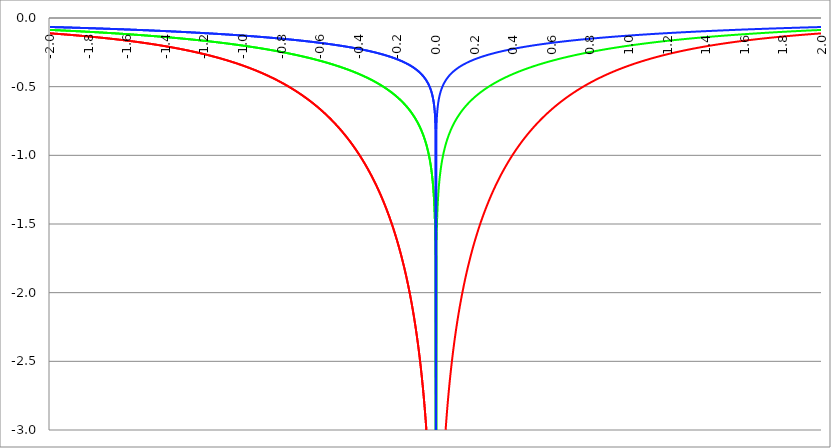
| Category | Series 1 | Series 0 | Series 2 |
|---|---|---|---|
| -2.0 | -0.112 | -0.087 | -0.065 |
| -1.998 | -0.112 | -0.087 | -0.066 |
| -1.996 | -0.112 | -0.087 | -0.066 |
| -1.994 | -0.112 | -0.087 | -0.066 |
| -1.992 | -0.112 | -0.087 | -0.066 |
| -1.99 | -0.113 | -0.087 | -0.066 |
| -1.988 | -0.113 | -0.087 | -0.066 |
| -1.986 | -0.113 | -0.088 | -0.066 |
| -1.984 | -0.113 | -0.088 | -0.066 |
| -1.982 | -0.113 | -0.088 | -0.066 |
| -1.98 | -0.114 | -0.088 | -0.066 |
| -1.978 | -0.114 | -0.088 | -0.066 |
| -1.976 | -0.114 | -0.088 | -0.066 |
| -1.974 | -0.114 | -0.088 | -0.066 |
| -1.972 | -0.114 | -0.088 | -0.067 |
| -1.97 | -0.115 | -0.089 | -0.067 |
| -1.968 | -0.115 | -0.089 | -0.067 |
| -1.966 | -0.115 | -0.089 | -0.067 |
| -1.964 | -0.115 | -0.089 | -0.067 |
| -1.962 | -0.115 | -0.089 | -0.067 |
| -1.96 | -0.116 | -0.089 | -0.067 |
| -1.958 | -0.116 | -0.089 | -0.067 |
| -1.956 | -0.116 | -0.089 | -0.067 |
| -1.954 | -0.116 | -0.09 | -0.067 |
| -1.952 | -0.117 | -0.09 | -0.067 |
| -1.95 | -0.117 | -0.09 | -0.067 |
| -1.948 | -0.117 | -0.09 | -0.068 |
| -1.946 | -0.117 | -0.09 | -0.068 |
| -1.944 | -0.117 | -0.09 | -0.068 |
| -1.942 | -0.118 | -0.09 | -0.068 |
| -1.94 | -0.118 | -0.091 | -0.068 |
| -1.938 | -0.118 | -0.091 | -0.068 |
| -1.936 | -0.118 | -0.091 | -0.068 |
| -1.934 | -0.118 | -0.091 | -0.068 |
| -1.932 | -0.119 | -0.091 | -0.068 |
| -1.93 | -0.119 | -0.091 | -0.068 |
| -1.928 | -0.119 | -0.091 | -0.068 |
| -1.926 | -0.119 | -0.091 | -0.068 |
| -1.924 | -0.12 | -0.092 | -0.068 |
| -1.922 | -0.12 | -0.092 | -0.069 |
| -1.92 | -0.12 | -0.092 | -0.069 |
| -1.918 | -0.12 | -0.092 | -0.069 |
| -1.916 | -0.12 | -0.092 | -0.069 |
| -1.914 | -0.121 | -0.092 | -0.069 |
| -1.912 | -0.121 | -0.092 | -0.069 |
| -1.91 | -0.121 | -0.093 | -0.069 |
| -1.908 | -0.121 | -0.093 | -0.069 |
| -1.906 | -0.122 | -0.093 | -0.069 |
| -1.904 | -0.122 | -0.093 | -0.069 |
| -1.902 | -0.122 | -0.093 | -0.069 |
| -1.9 | -0.122 | -0.093 | -0.069 |
| -1.898 | -0.122 | -0.093 | -0.07 |
| -1.896 | -0.123 | -0.093 | -0.07 |
| -1.894 | -0.123 | -0.094 | -0.07 |
| -1.892 | -0.123 | -0.094 | -0.07 |
| -1.89 | -0.123 | -0.094 | -0.07 |
| -1.888 | -0.124 | -0.094 | -0.07 |
| -1.886 | -0.124 | -0.094 | -0.07 |
| -1.884 | -0.124 | -0.094 | -0.07 |
| -1.882 | -0.124 | -0.094 | -0.07 |
| -1.88 | -0.125 | -0.095 | -0.07 |
| -1.878 | -0.125 | -0.095 | -0.07 |
| -1.876 | -0.125 | -0.095 | -0.07 |
| -1.874 | -0.125 | -0.095 | -0.071 |
| -1.872 | -0.126 | -0.095 | -0.071 |
| -1.87 | -0.126 | -0.095 | -0.071 |
| -1.868 | -0.126 | -0.095 | -0.071 |
| -1.866 | -0.126 | -0.096 | -0.071 |
| -1.864 | -0.126 | -0.096 | -0.071 |
| -1.862 | -0.127 | -0.096 | -0.071 |
| -1.86 | -0.127 | -0.096 | -0.071 |
| -1.858 | -0.127 | -0.096 | -0.071 |
| -1.856 | -0.127 | -0.096 | -0.071 |
| -1.854 | -0.128 | -0.096 | -0.071 |
| -1.852 | -0.128 | -0.097 | -0.072 |
| -1.85 | -0.128 | -0.097 | -0.072 |
| -1.848 | -0.128 | -0.097 | -0.072 |
| -1.846 | -0.129 | -0.097 | -0.072 |
| -1.844 | -0.129 | -0.097 | -0.072 |
| -1.842 | -0.129 | -0.097 | -0.072 |
| -1.84 | -0.129 | -0.098 | -0.072 |
| -1.838 | -0.13 | -0.098 | -0.072 |
| -1.836 | -0.13 | -0.098 | -0.072 |
| -1.834 | -0.13 | -0.098 | -0.072 |
| -1.832 | -0.13 | -0.098 | -0.072 |
| -1.83 | -0.131 | -0.098 | -0.072 |
| -1.828 | -0.131 | -0.098 | -0.073 |
| -1.826 | -0.131 | -0.099 | -0.073 |
| -1.824 | -0.131 | -0.099 | -0.073 |
| -1.822 | -0.132 | -0.099 | -0.073 |
| -1.82 | -0.132 | -0.099 | -0.073 |
| -1.818 | -0.132 | -0.099 | -0.073 |
| -1.816 | -0.132 | -0.099 | -0.073 |
| -1.814 | -0.133 | -0.099 | -0.073 |
| -1.812 | -0.133 | -0.1 | -0.073 |
| -1.81 | -0.133 | -0.1 | -0.073 |
| -1.808 | -0.133 | -0.1 | -0.073 |
| -1.806 | -0.134 | -0.1 | -0.074 |
| -1.804 | -0.134 | -0.1 | -0.074 |
| -1.802 | -0.134 | -0.1 | -0.074 |
| -1.8 | -0.134 | -0.101 | -0.074 |
| -1.798 | -0.135 | -0.101 | -0.074 |
| -1.796 | -0.135 | -0.101 | -0.074 |
| -1.794 | -0.135 | -0.101 | -0.074 |
| -1.792 | -0.136 | -0.101 | -0.074 |
| -1.79 | -0.136 | -0.101 | -0.074 |
| -1.788 | -0.136 | -0.101 | -0.074 |
| -1.786 | -0.136 | -0.102 | -0.074 |
| -1.784 | -0.137 | -0.102 | -0.075 |
| -1.782 | -0.137 | -0.102 | -0.075 |
| -1.78 | -0.137 | -0.102 | -0.075 |
| -1.778 | -0.137 | -0.102 | -0.075 |
| -1.776 | -0.138 | -0.102 | -0.075 |
| -1.774 | -0.138 | -0.103 | -0.075 |
| -1.772 | -0.138 | -0.103 | -0.075 |
| -1.77 | -0.139 | -0.103 | -0.075 |
| -1.768 | -0.139 | -0.103 | -0.075 |
| -1.766 | -0.139 | -0.103 | -0.075 |
| -1.764 | -0.139 | -0.103 | -0.076 |
| -1.762 | -0.14 | -0.103 | -0.076 |
| -1.76 | -0.14 | -0.104 | -0.076 |
| -1.758 | -0.14 | -0.104 | -0.076 |
| -1.756 | -0.14 | -0.104 | -0.076 |
| -1.754 | -0.141 | -0.104 | -0.076 |
| -1.752 | -0.141 | -0.104 | -0.076 |
| -1.75 | -0.141 | -0.104 | -0.076 |
| -1.748 | -0.142 | -0.105 | -0.076 |
| -1.746 | -0.142 | -0.105 | -0.076 |
| -1.744 | -0.142 | -0.105 | -0.076 |
| -1.742 | -0.142 | -0.105 | -0.077 |
| -1.74 | -0.143 | -0.105 | -0.077 |
| -1.738 | -0.143 | -0.105 | -0.077 |
| -1.736 | -0.143 | -0.106 | -0.077 |
| -1.734 | -0.144 | -0.106 | -0.077 |
| -1.732 | -0.144 | -0.106 | -0.077 |
| -1.73 | -0.144 | -0.106 | -0.077 |
| -1.728 | -0.144 | -0.106 | -0.077 |
| -1.726 | -0.145 | -0.106 | -0.077 |
| -1.724 | -0.145 | -0.107 | -0.077 |
| -1.722 | -0.145 | -0.107 | -0.078 |
| -1.72 | -0.146 | -0.107 | -0.078 |
| -1.718 | -0.146 | -0.107 | -0.078 |
| -1.716 | -0.146 | -0.107 | -0.078 |
| -1.714 | -0.146 | -0.107 | -0.078 |
| -1.712 | -0.147 | -0.108 | -0.078 |
| -1.71 | -0.147 | -0.108 | -0.078 |
| -1.708 | -0.147 | -0.108 | -0.078 |
| -1.706 | -0.148 | -0.108 | -0.078 |
| -1.704 | -0.148 | -0.108 | -0.078 |
| -1.702 | -0.148 | -0.108 | -0.078 |
| -1.7 | -0.149 | -0.109 | -0.079 |
| -1.698 | -0.149 | -0.109 | -0.079 |
| -1.696 | -0.149 | -0.109 | -0.079 |
| -1.694 | -0.149 | -0.109 | -0.079 |
| -1.692 | -0.15 | -0.109 | -0.079 |
| -1.69 | -0.15 | -0.109 | -0.079 |
| -1.688 | -0.15 | -0.11 | -0.079 |
| -1.686 | -0.151 | -0.11 | -0.079 |
| -1.684 | -0.151 | -0.11 | -0.079 |
| -1.682 | -0.151 | -0.11 | -0.079 |
| -1.68 | -0.152 | -0.11 | -0.08 |
| -1.678 | -0.152 | -0.111 | -0.08 |
| -1.676 | -0.152 | -0.111 | -0.08 |
| -1.674 | -0.153 | -0.111 | -0.08 |
| -1.672 | -0.153 | -0.111 | -0.08 |
| -1.67 | -0.153 | -0.111 | -0.08 |
| -1.668 | -0.154 | -0.111 | -0.08 |
| -1.666 | -0.154 | -0.112 | -0.08 |
| -1.664 | -0.154 | -0.112 | -0.08 |
| -1.662 | -0.154 | -0.112 | -0.08 |
| -1.66 | -0.155 | -0.112 | -0.081 |
| -1.658 | -0.155 | -0.112 | -0.081 |
| -1.656 | -0.155 | -0.112 | -0.081 |
| -1.654 | -0.156 | -0.113 | -0.081 |
| -1.652 | -0.156 | -0.113 | -0.081 |
| -1.65 | -0.156 | -0.113 | -0.081 |
| -1.648 | -0.157 | -0.113 | -0.081 |
| -1.646 | -0.157 | -0.113 | -0.081 |
| -1.644 | -0.157 | -0.114 | -0.081 |
| -1.642 | -0.158 | -0.114 | -0.082 |
| -1.64 | -0.158 | -0.114 | -0.082 |
| -1.638 | -0.158 | -0.114 | -0.082 |
| -1.636 | -0.159 | -0.114 | -0.082 |
| -1.634 | -0.159 | -0.114 | -0.082 |
| -1.632 | -0.159 | -0.115 | -0.082 |
| -1.63 | -0.16 | -0.115 | -0.082 |
| -1.628 | -0.16 | -0.115 | -0.082 |
| -1.626 | -0.16 | -0.115 | -0.082 |
| -1.624 | -0.161 | -0.115 | -0.082 |
| -1.622 | -0.161 | -0.116 | -0.083 |
| -1.62 | -0.161 | -0.116 | -0.083 |
| -1.618 | -0.162 | -0.116 | -0.083 |
| -1.616 | -0.162 | -0.116 | -0.083 |
| -1.614 | -0.162 | -0.116 | -0.083 |
| -1.612 | -0.163 | -0.116 | -0.083 |
| -1.61 | -0.163 | -0.117 | -0.083 |
| -1.608 | -0.163 | -0.117 | -0.083 |
| -1.606 | -0.164 | -0.117 | -0.083 |
| -1.604 | -0.164 | -0.117 | -0.084 |
| -1.602 | -0.165 | -0.117 | -0.084 |
| -1.6 | -0.165 | -0.118 | -0.084 |
| -1.598 | -0.165 | -0.118 | -0.084 |
| -1.596 | -0.166 | -0.118 | -0.084 |
| -1.594 | -0.166 | -0.118 | -0.084 |
| -1.592 | -0.166 | -0.118 | -0.084 |
| -1.59 | -0.167 | -0.119 | -0.084 |
| -1.588 | -0.167 | -0.119 | -0.084 |
| -1.586 | -0.167 | -0.119 | -0.085 |
| -1.584 | -0.168 | -0.119 | -0.085 |
| -1.582 | -0.168 | -0.119 | -0.085 |
| -1.58 | -0.168 | -0.12 | -0.085 |
| -1.578 | -0.169 | -0.12 | -0.085 |
| -1.576 | -0.169 | -0.12 | -0.085 |
| -1.574 | -0.17 | -0.12 | -0.085 |
| -1.572 | -0.17 | -0.12 | -0.085 |
| -1.57 | -0.17 | -0.121 | -0.085 |
| -1.568 | -0.171 | -0.121 | -0.086 |
| -1.566 | -0.171 | -0.121 | -0.086 |
| -1.564 | -0.171 | -0.121 | -0.086 |
| -1.562 | -0.172 | -0.121 | -0.086 |
| -1.56 | -0.172 | -0.122 | -0.086 |
| -1.558 | -0.172 | -0.122 | -0.086 |
| -1.556 | -0.173 | -0.122 | -0.086 |
| -1.554 | -0.173 | -0.122 | -0.086 |
| -1.552 | -0.174 | -0.122 | -0.086 |
| -1.55 | -0.174 | -0.123 | -0.087 |
| -1.548 | -0.174 | -0.123 | -0.087 |
| -1.546 | -0.175 | -0.123 | -0.087 |
| -1.544 | -0.175 | -0.123 | -0.087 |
| -1.542 | -0.176 | -0.123 | -0.087 |
| -1.54 | -0.176 | -0.124 | -0.087 |
| -1.538 | -0.176 | -0.124 | -0.087 |
| -1.536 | -0.177 | -0.124 | -0.087 |
| -1.534 | -0.177 | -0.124 | -0.087 |
| -1.532 | -0.177 | -0.124 | -0.088 |
| -1.53 | -0.178 | -0.125 | -0.088 |
| -1.528 | -0.178 | -0.125 | -0.088 |
| -1.526 | -0.179 | -0.125 | -0.088 |
| -1.524 | -0.179 | -0.125 | -0.088 |
| -1.522 | -0.179 | -0.125 | -0.088 |
| -1.52 | -0.18 | -0.126 | -0.088 |
| -1.518 | -0.18 | -0.126 | -0.088 |
| -1.516 | -0.181 | -0.126 | -0.088 |
| -1.514 | -0.181 | -0.126 | -0.089 |
| -1.512 | -0.181 | -0.126 | -0.089 |
| -1.51 | -0.182 | -0.127 | -0.089 |
| -1.508 | -0.182 | -0.127 | -0.089 |
| -1.506 | -0.183 | -0.127 | -0.089 |
| -1.504 | -0.183 | -0.127 | -0.089 |
| -1.502 | -0.183 | -0.127 | -0.089 |
| -1.5 | -0.184 | -0.128 | -0.089 |
| -1.498 | -0.184 | -0.128 | -0.09 |
| -1.496 | -0.185 | -0.128 | -0.09 |
| -1.494 | -0.185 | -0.128 | -0.09 |
| -1.492 | -0.186 | -0.129 | -0.09 |
| -1.49 | -0.186 | -0.129 | -0.09 |
| -1.488 | -0.186 | -0.129 | -0.09 |
| -1.486 | -0.187 | -0.129 | -0.09 |
| -1.484 | -0.187 | -0.129 | -0.09 |
| -1.482 | -0.188 | -0.13 | -0.09 |
| -1.48 | -0.188 | -0.13 | -0.091 |
| -1.478 | -0.188 | -0.13 | -0.091 |
| -1.476 | -0.189 | -0.13 | -0.091 |
| -1.474 | -0.189 | -0.131 | -0.091 |
| -1.472 | -0.19 | -0.131 | -0.091 |
| -1.469999999999999 | -0.19 | -0.131 | -0.091 |
| -1.467999999999999 | -0.191 | -0.131 | -0.091 |
| -1.465999999999999 | -0.191 | -0.131 | -0.091 |
| -1.463999999999999 | -0.191 | -0.132 | -0.092 |
| -1.461999999999999 | -0.192 | -0.132 | -0.092 |
| -1.459999999999999 | -0.192 | -0.132 | -0.092 |
| -1.457999999999999 | -0.193 | -0.132 | -0.092 |
| -1.455999999999999 | -0.193 | -0.133 | -0.092 |
| -1.453999999999999 | -0.194 | -0.133 | -0.092 |
| -1.451999999999999 | -0.194 | -0.133 | -0.092 |
| -1.449999999999999 | -0.195 | -0.133 | -0.092 |
| -1.447999999999999 | -0.195 | -0.133 | -0.093 |
| -1.445999999999999 | -0.195 | -0.134 | -0.093 |
| -1.443999999999999 | -0.196 | -0.134 | -0.093 |
| -1.441999999999999 | -0.196 | -0.134 | -0.093 |
| -1.439999999999999 | -0.197 | -0.134 | -0.093 |
| -1.437999999999999 | -0.197 | -0.135 | -0.093 |
| -1.435999999999999 | -0.198 | -0.135 | -0.093 |
| -1.433999999999999 | -0.198 | -0.135 | -0.093 |
| -1.431999999999999 | -0.199 | -0.135 | -0.094 |
| -1.429999999999999 | -0.199 | -0.135 | -0.094 |
| -1.427999999999999 | -0.2 | -0.136 | -0.094 |
| -1.425999999999999 | -0.2 | -0.136 | -0.094 |
| -1.423999999999999 | -0.2 | -0.136 | -0.094 |
| -1.421999999999999 | -0.201 | -0.136 | -0.094 |
| -1.419999999999999 | -0.201 | -0.137 | -0.094 |
| -1.417999999999999 | -0.202 | -0.137 | -0.094 |
| -1.415999999999999 | -0.202 | -0.137 | -0.095 |
| -1.413999999999999 | -0.203 | -0.137 | -0.095 |
| -1.411999999999999 | -0.203 | -0.138 | -0.095 |
| -1.409999999999999 | -0.204 | -0.138 | -0.095 |
| -1.407999999999999 | -0.204 | -0.138 | -0.095 |
| -1.405999999999999 | -0.205 | -0.138 | -0.095 |
| -1.403999999999999 | -0.205 | -0.139 | -0.095 |
| -1.401999999999999 | -0.206 | -0.139 | -0.095 |
| -1.399999999999999 | -0.206 | -0.139 | -0.096 |
| -1.397999999999999 | -0.207 | -0.139 | -0.096 |
| -1.395999999999999 | -0.207 | -0.139 | -0.096 |
| -1.393999999999999 | -0.208 | -0.14 | -0.096 |
| -1.391999999999999 | -0.208 | -0.14 | -0.096 |
| -1.389999999999999 | -0.209 | -0.14 | -0.096 |
| -1.387999999999999 | -0.209 | -0.14 | -0.096 |
| -1.385999999999999 | -0.21 | -0.141 | -0.097 |
| -1.383999999999999 | -0.21 | -0.141 | -0.097 |
| -1.381999999999999 | -0.211 | -0.141 | -0.097 |
| -1.379999999999999 | -0.211 | -0.141 | -0.097 |
| -1.377999999999999 | -0.212 | -0.142 | -0.097 |
| -1.375999999999999 | -0.212 | -0.142 | -0.097 |
| -1.373999999999999 | -0.213 | -0.142 | -0.097 |
| -1.371999999999999 | -0.213 | -0.142 | -0.097 |
| -1.369999999999999 | -0.214 | -0.143 | -0.098 |
| -1.367999999999999 | -0.214 | -0.143 | -0.098 |
| -1.365999999999999 | -0.215 | -0.143 | -0.098 |
| -1.363999999999999 | -0.215 | -0.143 | -0.098 |
| -1.361999999999999 | -0.216 | -0.144 | -0.098 |
| -1.359999999999999 | -0.216 | -0.144 | -0.098 |
| -1.357999999999999 | -0.217 | -0.144 | -0.098 |
| -1.355999999999999 | -0.217 | -0.144 | -0.099 |
| -1.353999999999999 | -0.218 | -0.145 | -0.099 |
| -1.351999999999999 | -0.218 | -0.145 | -0.099 |
| -1.349999999999999 | -0.219 | -0.145 | -0.099 |
| -1.347999999999999 | -0.219 | -0.145 | -0.099 |
| -1.345999999999999 | -0.22 | -0.146 | -0.099 |
| -1.343999999999999 | -0.22 | -0.146 | -0.099 |
| -1.341999999999999 | -0.221 | -0.146 | -0.1 |
| -1.339999999999999 | -0.221 | -0.146 | -0.1 |
| -1.337999999999999 | -0.222 | -0.147 | -0.1 |
| -1.335999999999999 | -0.222 | -0.147 | -0.1 |
| -1.333999999999999 | -0.223 | -0.147 | -0.1 |
| -1.331999999999999 | -0.224 | -0.148 | -0.1 |
| -1.329999999999999 | -0.224 | -0.148 | -0.1 |
| -1.327999999999999 | -0.225 | -0.148 | -0.1 |
| -1.325999999999999 | -0.225 | -0.148 | -0.101 |
| -1.323999999999999 | -0.226 | -0.149 | -0.101 |
| -1.321999999999999 | -0.226 | -0.149 | -0.101 |
| -1.319999999999999 | -0.227 | -0.149 | -0.101 |
| -1.317999999999999 | -0.227 | -0.149 | -0.101 |
| -1.315999999999999 | -0.228 | -0.15 | -0.101 |
| -1.313999999999999 | -0.228 | -0.15 | -0.101 |
| -1.311999999999999 | -0.229 | -0.15 | -0.102 |
| -1.309999999999999 | -0.23 | -0.15 | -0.102 |
| -1.307999999999999 | -0.23 | -0.151 | -0.102 |
| -1.305999999999999 | -0.231 | -0.151 | -0.102 |
| -1.303999999999999 | -0.231 | -0.151 | -0.102 |
| -1.301999999999999 | -0.232 | -0.151 | -0.102 |
| -1.299999999999999 | -0.232 | -0.152 | -0.102 |
| -1.297999999999999 | -0.233 | -0.152 | -0.103 |
| -1.295999999999999 | -0.234 | -0.152 | -0.103 |
| -1.293999999999999 | -0.234 | -0.153 | -0.103 |
| -1.291999999999999 | -0.235 | -0.153 | -0.103 |
| -1.289999999999999 | -0.235 | -0.153 | -0.103 |
| -1.287999999999999 | -0.236 | -0.153 | -0.103 |
| -1.285999999999999 | -0.236 | -0.154 | -0.103 |
| -1.283999999999999 | -0.237 | -0.154 | -0.104 |
| -1.281999999999999 | -0.238 | -0.154 | -0.104 |
| -1.279999999999999 | -0.238 | -0.154 | -0.104 |
| -1.277999999999999 | -0.239 | -0.155 | -0.104 |
| -1.275999999999999 | -0.239 | -0.155 | -0.104 |
| -1.273999999999999 | -0.24 | -0.155 | -0.104 |
| -1.271999999999999 | -0.241 | -0.156 | -0.105 |
| -1.269999999999999 | -0.241 | -0.156 | -0.105 |
| -1.267999999999999 | -0.242 | -0.156 | -0.105 |
| -1.265999999999999 | -0.242 | -0.156 | -0.105 |
| -1.263999999999999 | -0.243 | -0.157 | -0.105 |
| -1.261999999999999 | -0.244 | -0.157 | -0.105 |
| -1.259999999999999 | -0.244 | -0.157 | -0.105 |
| -1.257999999999999 | -0.245 | -0.158 | -0.106 |
| -1.255999999999999 | -0.245 | -0.158 | -0.106 |
| -1.253999999999999 | -0.246 | -0.158 | -0.106 |
| -1.251999999999999 | -0.247 | -0.158 | -0.106 |
| -1.249999999999999 | -0.247 | -0.159 | -0.106 |
| -1.247999999999999 | -0.248 | -0.159 | -0.106 |
| -1.245999999999999 | -0.249 | -0.159 | -0.106 |
| -1.243999999999999 | -0.249 | -0.16 | -0.107 |
| -1.241999999999999 | -0.25 | -0.16 | -0.107 |
| -1.239999999999999 | -0.25 | -0.16 | -0.107 |
| -1.237999999999999 | -0.251 | -0.16 | -0.107 |
| -1.235999999999999 | -0.252 | -0.161 | -0.107 |
| -1.233999999999999 | -0.252 | -0.161 | -0.107 |
| -1.231999999999999 | -0.253 | -0.161 | -0.108 |
| -1.229999999999999 | -0.254 | -0.162 | -0.108 |
| -1.227999999999999 | -0.254 | -0.162 | -0.108 |
| -1.225999999999999 | -0.255 | -0.162 | -0.108 |
| -1.223999999999999 | -0.256 | -0.163 | -0.108 |
| -1.221999999999999 | -0.256 | -0.163 | -0.108 |
| -1.219999999999999 | -0.257 | -0.163 | -0.108 |
| -1.217999999999999 | -0.258 | -0.163 | -0.109 |
| -1.215999999999999 | -0.258 | -0.164 | -0.109 |
| -1.213999999999999 | -0.259 | -0.164 | -0.109 |
| -1.211999999999999 | -0.26 | -0.164 | -0.109 |
| -1.209999999999999 | -0.26 | -0.165 | -0.109 |
| -1.207999999999999 | -0.261 | -0.165 | -0.109 |
| -1.205999999999999 | -0.262 | -0.165 | -0.11 |
| -1.203999999999999 | -0.262 | -0.166 | -0.11 |
| -1.201999999999999 | -0.263 | -0.166 | -0.11 |
| -1.199999999999999 | -0.264 | -0.166 | -0.11 |
| -1.197999999999999 | -0.264 | -0.166 | -0.11 |
| -1.195999999999999 | -0.265 | -0.167 | -0.11 |
| -1.193999999999999 | -0.266 | -0.167 | -0.111 |
| -1.191999999999999 | -0.266 | -0.167 | -0.111 |
| -1.189999999999999 | -0.267 | -0.168 | -0.111 |
| -1.187999999999999 | -0.268 | -0.168 | -0.111 |
| -1.185999999999999 | -0.269 | -0.168 | -0.111 |
| -1.183999999999999 | -0.269 | -0.169 | -0.111 |
| -1.181999999999999 | -0.27 | -0.169 | -0.112 |
| -1.179999999999999 | -0.271 | -0.169 | -0.112 |
| -1.177999999999999 | -0.271 | -0.17 | -0.112 |
| -1.175999999999999 | -0.272 | -0.17 | -0.112 |
| -1.173999999999999 | -0.273 | -0.17 | -0.112 |
| -1.171999999999999 | -0.273 | -0.171 | -0.112 |
| -1.169999999999999 | -0.274 | -0.171 | -0.112 |
| -1.167999999999999 | -0.275 | -0.171 | -0.113 |
| -1.165999999999999 | -0.276 | -0.171 | -0.113 |
| -1.163999999999999 | -0.276 | -0.172 | -0.113 |
| -1.161999999999999 | -0.277 | -0.172 | -0.113 |
| -1.159999999999999 | -0.278 | -0.172 | -0.113 |
| -1.157999999999999 | -0.279 | -0.173 | -0.113 |
| -1.155999999999999 | -0.279 | -0.173 | -0.114 |
| -1.153999999999999 | -0.28 | -0.173 | -0.114 |
| -1.151999999999999 | -0.281 | -0.174 | -0.114 |
| -1.149999999999999 | -0.282 | -0.174 | -0.114 |
| -1.147999999999999 | -0.282 | -0.174 | -0.114 |
| -1.145999999999999 | -0.283 | -0.175 | -0.114 |
| -1.143999999999999 | -0.284 | -0.175 | -0.115 |
| -1.141999999999999 | -0.285 | -0.175 | -0.115 |
| -1.139999999999999 | -0.285 | -0.176 | -0.115 |
| -1.137999999999999 | -0.286 | -0.176 | -0.115 |
| -1.135999999999999 | -0.287 | -0.176 | -0.115 |
| -1.133999999999999 | -0.288 | -0.177 | -0.116 |
| -1.131999999999999 | -0.288 | -0.177 | -0.116 |
| -1.129999999999999 | -0.289 | -0.177 | -0.116 |
| -1.127999999999999 | -0.29 | -0.178 | -0.116 |
| -1.125999999999999 | -0.291 | -0.178 | -0.116 |
| -1.123999999999999 | -0.292 | -0.178 | -0.116 |
| -1.121999999999999 | -0.292 | -0.179 | -0.117 |
| -1.119999999999999 | -0.293 | -0.179 | -0.117 |
| -1.117999999999999 | -0.294 | -0.179 | -0.117 |
| -1.115999999999999 | -0.295 | -0.18 | -0.117 |
| -1.113999999999999 | -0.296 | -0.18 | -0.117 |
| -1.111999999999999 | -0.296 | -0.18 | -0.117 |
| -1.109999999999999 | -0.297 | -0.181 | -0.118 |
| -1.107999999999999 | -0.298 | -0.181 | -0.118 |
| -1.105999999999999 | -0.299 | -0.181 | -0.118 |
| -1.103999999999999 | -0.3 | -0.182 | -0.118 |
| -1.101999999999999 | -0.3 | -0.182 | -0.118 |
| -1.099999999999999 | -0.301 | -0.182 | -0.118 |
| -1.097999999999999 | -0.302 | -0.183 | -0.119 |
| -1.095999999999999 | -0.303 | -0.183 | -0.119 |
| -1.093999999999999 | -0.304 | -0.184 | -0.119 |
| -1.091999999999999 | -0.305 | -0.184 | -0.119 |
| -1.089999999999999 | -0.305 | -0.184 | -0.119 |
| -1.087999999999999 | -0.306 | -0.185 | -0.12 |
| -1.085999999999999 | -0.307 | -0.185 | -0.12 |
| -1.083999999999999 | -0.308 | -0.185 | -0.12 |
| -1.081999999999999 | -0.309 | -0.186 | -0.12 |
| -1.079999999999999 | -0.31 | -0.186 | -0.12 |
| -1.077999999999999 | -0.31 | -0.186 | -0.12 |
| -1.075999999999999 | -0.311 | -0.187 | -0.121 |
| -1.073999999999999 | -0.312 | -0.187 | -0.121 |
| -1.071999999999999 | -0.313 | -0.187 | -0.121 |
| -1.069999999999999 | -0.314 | -0.188 | -0.121 |
| -1.067999999999999 | -0.315 | -0.188 | -0.121 |
| -1.065999999999999 | -0.316 | -0.189 | -0.122 |
| -1.063999999999999 | -0.317 | -0.189 | -0.122 |
| -1.061999999999999 | -0.317 | -0.189 | -0.122 |
| -1.059999999999999 | -0.318 | -0.19 | -0.122 |
| -1.057999999999999 | -0.319 | -0.19 | -0.122 |
| -1.055999999999999 | -0.32 | -0.19 | -0.123 |
| -1.053999999999999 | -0.321 | -0.191 | -0.123 |
| -1.051999999999999 | -0.322 | -0.191 | -0.123 |
| -1.049999999999999 | -0.323 | -0.192 | -0.123 |
| -1.047999999999999 | -0.324 | -0.192 | -0.123 |
| -1.045999999999999 | -0.325 | -0.192 | -0.123 |
| -1.043999999999999 | -0.326 | -0.193 | -0.124 |
| -1.041999999999999 | -0.326 | -0.193 | -0.124 |
| -1.039999999999999 | -0.327 | -0.193 | -0.124 |
| -1.037999999999999 | -0.328 | -0.194 | -0.124 |
| -1.035999999999999 | -0.329 | -0.194 | -0.124 |
| -1.033999999999999 | -0.33 | -0.195 | -0.125 |
| -1.031999999999999 | -0.331 | -0.195 | -0.125 |
| -1.029999999999999 | -0.332 | -0.195 | -0.125 |
| -1.027999999999999 | -0.333 | -0.196 | -0.125 |
| -1.025999999999999 | -0.334 | -0.196 | -0.125 |
| -1.023999999999999 | -0.335 | -0.196 | -0.126 |
| -1.021999999999999 | -0.336 | -0.197 | -0.126 |
| -1.019999999999999 | -0.337 | -0.197 | -0.126 |
| -1.017999999999999 | -0.338 | -0.198 | -0.126 |
| -1.015999999999999 | -0.339 | -0.198 | -0.126 |
| -1.013999999999999 | -0.34 | -0.198 | -0.127 |
| -1.011999999999999 | -0.341 | -0.199 | -0.127 |
| -1.009999999999999 | -0.342 | -0.199 | -0.127 |
| -1.007999999999999 | -0.343 | -0.2 | -0.127 |
| -1.005999999999999 | -0.344 | -0.2 | -0.127 |
| -1.003999999999999 | -0.345 | -0.2 | -0.128 |
| -1.001999999999999 | -0.346 | -0.201 | -0.128 |
| -0.999999999999999 | -0.347 | -0.201 | -0.128 |
| -0.997999999999999 | -0.348 | -0.202 | -0.128 |
| -0.995999999999999 | -0.349 | -0.202 | -0.128 |
| -0.993999999999999 | -0.35 | -0.202 | -0.129 |
| -0.991999999999999 | -0.351 | -0.203 | -0.129 |
| -0.989999999999999 | -0.352 | -0.203 | -0.129 |
| -0.987999999999999 | -0.353 | -0.204 | -0.129 |
| -0.985999999999999 | -0.354 | -0.204 | -0.129 |
| -0.983999999999999 | -0.355 | -0.204 | -0.13 |
| -0.981999999999999 | -0.356 | -0.205 | -0.13 |
| -0.979999999999999 | -0.357 | -0.205 | -0.13 |
| -0.977999999999999 | -0.358 | -0.206 | -0.13 |
| -0.975999999999999 | -0.359 | -0.206 | -0.13 |
| -0.973999999999999 | -0.36 | -0.206 | -0.131 |
| -0.971999999999999 | -0.361 | -0.207 | -0.131 |
| -0.969999999999999 | -0.362 | -0.207 | -0.131 |
| -0.967999999999999 | -0.363 | -0.208 | -0.131 |
| -0.965999999999999 | -0.364 | -0.208 | -0.131 |
| -0.963999999999999 | -0.365 | -0.209 | -0.132 |
| -0.961999999999999 | -0.366 | -0.209 | -0.132 |
| -0.959999999999999 | -0.367 | -0.209 | -0.132 |
| -0.957999999999999 | -0.368 | -0.21 | -0.132 |
| -0.955999999999999 | -0.37 | -0.21 | -0.132 |
| -0.953999999999999 | -0.371 | -0.211 | -0.133 |
| -0.951999999999999 | -0.372 | -0.211 | -0.133 |
| -0.949999999999999 | -0.373 | -0.212 | -0.133 |
| -0.947999999999999 | -0.374 | -0.212 | -0.133 |
| -0.945999999999999 | -0.375 | -0.212 | -0.134 |
| -0.943999999999999 | -0.376 | -0.213 | -0.134 |
| -0.941999999999999 | -0.377 | -0.213 | -0.134 |
| -0.939999999999999 | -0.378 | -0.214 | -0.134 |
| -0.937999999999999 | -0.38 | -0.214 | -0.134 |
| -0.935999999999999 | -0.381 | -0.215 | -0.135 |
| -0.933999999999999 | -0.382 | -0.215 | -0.135 |
| -0.931999999999999 | -0.383 | -0.215 | -0.135 |
| -0.929999999999999 | -0.384 | -0.216 | -0.135 |
| -0.927999999999999 | -0.385 | -0.216 | -0.135 |
| -0.925999999999999 | -0.386 | -0.217 | -0.136 |
| -0.923999999999999 | -0.388 | -0.217 | -0.136 |
| -0.921999999999999 | -0.389 | -0.218 | -0.136 |
| -0.919999999999999 | -0.39 | -0.218 | -0.136 |
| -0.917999999999999 | -0.391 | -0.219 | -0.137 |
| -0.915999999999999 | -0.392 | -0.219 | -0.137 |
| -0.913999999999999 | -0.394 | -0.219 | -0.137 |
| -0.911999999999999 | -0.395 | -0.22 | -0.137 |
| -0.909999999999999 | -0.396 | -0.22 | -0.137 |
| -0.907999999999999 | -0.397 | -0.221 | -0.138 |
| -0.905999999999999 | -0.398 | -0.221 | -0.138 |
| -0.903999999999999 | -0.4 | -0.222 | -0.138 |
| -0.901999999999999 | -0.401 | -0.222 | -0.138 |
| -0.899999999999999 | -0.402 | -0.223 | -0.139 |
| -0.897999999999999 | -0.403 | -0.223 | -0.139 |
| -0.895999999999999 | -0.404 | -0.224 | -0.139 |
| -0.893999999999999 | -0.406 | -0.224 | -0.139 |
| -0.891999999999999 | -0.407 | -0.225 | -0.139 |
| -0.889999999999999 | -0.408 | -0.225 | -0.14 |
| -0.887999999999999 | -0.409 | -0.225 | -0.14 |
| -0.885999999999999 | -0.411 | -0.226 | -0.14 |
| -0.883999999999999 | -0.412 | -0.226 | -0.14 |
| -0.881999999999999 | -0.413 | -0.227 | -0.141 |
| -0.879999999999999 | -0.415 | -0.227 | -0.141 |
| -0.877999999999999 | -0.416 | -0.228 | -0.141 |
| -0.875999999999999 | -0.417 | -0.228 | -0.141 |
| -0.873999999999999 | -0.418 | -0.229 | -0.142 |
| -0.871999999999999 | -0.42 | -0.229 | -0.142 |
| -0.869999999999999 | -0.421 | -0.23 | -0.142 |
| -0.867999999999999 | -0.422 | -0.23 | -0.142 |
| -0.865999999999999 | -0.424 | -0.231 | -0.143 |
| -0.863999999999999 | -0.425 | -0.231 | -0.143 |
| -0.861999999999999 | -0.426 | -0.232 | -0.143 |
| -0.859999999999999 | -0.428 | -0.232 | -0.143 |
| -0.857999999999999 | -0.429 | -0.233 | -0.143 |
| -0.855999999999999 | -0.43 | -0.233 | -0.144 |
| -0.853999999999999 | -0.432 | -0.234 | -0.144 |
| -0.851999999999999 | -0.433 | -0.234 | -0.144 |
| -0.849999999999999 | -0.434 | -0.235 | -0.144 |
| -0.847999999999999 | -0.436 | -0.235 | -0.145 |
| -0.845999999999999 | -0.437 | -0.236 | -0.145 |
| -0.843999999999999 | -0.439 | -0.236 | -0.145 |
| -0.841999999999999 | -0.44 | -0.237 | -0.145 |
| -0.839999999999999 | -0.441 | -0.237 | -0.146 |
| -0.837999999999999 | -0.443 | -0.238 | -0.146 |
| -0.835999999999999 | -0.444 | -0.238 | -0.146 |
| -0.833999999999999 | -0.446 | -0.239 | -0.146 |
| -0.831999999999999 | -0.447 | -0.239 | -0.147 |
| -0.829999999999999 | -0.448 | -0.24 | -0.147 |
| -0.827999999999999 | -0.45 | -0.24 | -0.147 |
| -0.825999999999999 | -0.451 | -0.241 | -0.147 |
| -0.823999999999999 | -0.453 | -0.241 | -0.148 |
| -0.821999999999999 | -0.454 | -0.242 | -0.148 |
| -0.819999999999999 | -0.456 | -0.242 | -0.148 |
| -0.817999999999999 | -0.457 | -0.243 | -0.148 |
| -0.815999999999999 | -0.459 | -0.243 | -0.149 |
| -0.813999999999999 | -0.46 | -0.244 | -0.149 |
| -0.811999999999999 | -0.461 | -0.244 | -0.149 |
| -0.809999999999999 | -0.463 | -0.245 | -0.149 |
| -0.807999999999999 | -0.464 | -0.245 | -0.15 |
| -0.805999999999999 | -0.466 | -0.246 | -0.15 |
| -0.803999999999999 | -0.467 | -0.247 | -0.15 |
| -0.801999999999999 | -0.469 | -0.247 | -0.15 |
| -0.799999999999999 | -0.47 | -0.248 | -0.151 |
| -0.797999999999999 | -0.472 | -0.248 | -0.151 |
| -0.795999999999999 | -0.474 | -0.249 | -0.151 |
| -0.793999999999999 | -0.475 | -0.249 | -0.151 |
| -0.791999999999999 | -0.477 | -0.25 | -0.152 |
| -0.789999999999999 | -0.478 | -0.25 | -0.152 |
| -0.787999999999999 | -0.48 | -0.251 | -0.152 |
| -0.785999999999999 | -0.481 | -0.251 | -0.153 |
| -0.783999999999999 | -0.483 | -0.252 | -0.153 |
| -0.781999999999999 | -0.484 | -0.253 | -0.153 |
| -0.779999999999999 | -0.486 | -0.253 | -0.153 |
| -0.777999999999999 | -0.488 | -0.254 | -0.154 |
| -0.775999999999999 | -0.489 | -0.254 | -0.154 |
| -0.773999999999999 | -0.491 | -0.255 | -0.154 |
| -0.771999999999999 | -0.493 | -0.255 | -0.154 |
| -0.769999999999999 | -0.494 | -0.256 | -0.155 |
| -0.767999999999999 | -0.496 | -0.256 | -0.155 |
| -0.765999999999999 | -0.497 | -0.257 | -0.155 |
| -0.763999999999999 | -0.499 | -0.258 | -0.155 |
| -0.761999999999999 | -0.501 | -0.258 | -0.156 |
| -0.759999999999999 | -0.502 | -0.259 | -0.156 |
| -0.757999999999999 | -0.504 | -0.259 | -0.156 |
| -0.755999999999999 | -0.506 | -0.26 | -0.157 |
| -0.753999999999999 | -0.507 | -0.26 | -0.157 |
| -0.751999999999999 | -0.509 | -0.261 | -0.157 |
| -0.749999999999999 | -0.511 | -0.262 | -0.157 |
| -0.747999999999999 | -0.513 | -0.262 | -0.158 |
| -0.745999999999999 | -0.514 | -0.263 | -0.158 |
| -0.743999999999999 | -0.516 | -0.263 | -0.158 |
| -0.741999999999999 | -0.518 | -0.264 | -0.159 |
| -0.739999999999999 | -0.519 | -0.265 | -0.159 |
| -0.737999999999999 | -0.521 | -0.265 | -0.159 |
| -0.735999999999999 | -0.523 | -0.266 | -0.159 |
| -0.733999999999999 | -0.525 | -0.266 | -0.16 |
| -0.731999999999999 | -0.527 | -0.267 | -0.16 |
| -0.729999999999999 | -0.528 | -0.268 | -0.16 |
| -0.727999999999999 | -0.53 | -0.268 | -0.161 |
| -0.725999999999999 | -0.532 | -0.269 | -0.161 |
| -0.723999999999999 | -0.534 | -0.269 | -0.161 |
| -0.721999999999999 | -0.536 | -0.27 | -0.161 |
| -0.719999999999999 | -0.537 | -0.271 | -0.162 |
| -0.717999999999999 | -0.539 | -0.271 | -0.162 |
| -0.715999999999999 | -0.541 | -0.272 | -0.162 |
| -0.713999999999999 | -0.543 | -0.272 | -0.163 |
| -0.711999999999999 | -0.545 | -0.273 | -0.163 |
| -0.709999999999999 | -0.547 | -0.274 | -0.163 |
| -0.707999999999999 | -0.548 | -0.274 | -0.163 |
| -0.705999999999999 | -0.55 | -0.275 | -0.164 |
| -0.703999999999999 | -0.552 | -0.276 | -0.164 |
| -0.701999999999999 | -0.554 | -0.276 | -0.164 |
| -0.699999999999999 | -0.556 | -0.277 | -0.165 |
| -0.697999999999999 | -0.558 | -0.278 | -0.165 |
| -0.695999999999999 | -0.56 | -0.278 | -0.165 |
| -0.693999999999999 | -0.562 | -0.279 | -0.166 |
| -0.691999999999999 | -0.564 | -0.279 | -0.166 |
| -0.689999999999999 | -0.566 | -0.28 | -0.166 |
| -0.687999999999999 | -0.568 | -0.281 | -0.166 |
| -0.685999999999999 | -0.57 | -0.281 | -0.167 |
| -0.683999999999999 | -0.572 | -0.282 | -0.167 |
| -0.681999999999999 | -0.574 | -0.283 | -0.167 |
| -0.679999999999999 | -0.576 | -0.283 | -0.168 |
| -0.677999999999999 | -0.578 | -0.284 | -0.168 |
| -0.675999999999999 | -0.58 | -0.285 | -0.168 |
| -0.673999999999999 | -0.582 | -0.285 | -0.169 |
| -0.671999999999999 | -0.584 | -0.286 | -0.169 |
| -0.669999999999999 | -0.586 | -0.287 | -0.169 |
| -0.667999999999999 | -0.588 | -0.287 | -0.17 |
| -0.665999999999999 | -0.59 | -0.288 | -0.17 |
| -0.663999999999999 | -0.592 | -0.289 | -0.17 |
| -0.661999999999999 | -0.594 | -0.289 | -0.171 |
| -0.659999999999999 | -0.596 | -0.29 | -0.171 |
| -0.657999999999999 | -0.598 | -0.291 | -0.171 |
| -0.655999999999999 | -0.601 | -0.291 | -0.172 |
| -0.653999999999999 | -0.603 | -0.292 | -0.172 |
| -0.651999999999999 | -0.605 | -0.293 | -0.172 |
| -0.649999999999999 | -0.607 | -0.294 | -0.172 |
| -0.647999999999999 | -0.609 | -0.294 | -0.173 |
| -0.645999999999999 | -0.611 | -0.295 | -0.173 |
| -0.643999999999999 | -0.614 | -0.296 | -0.173 |
| -0.641999999999999 | -0.616 | -0.296 | -0.174 |
| -0.639999999999999 | -0.618 | -0.297 | -0.174 |
| -0.637999999999999 | -0.62 | -0.298 | -0.174 |
| -0.635999999999999 | -0.622 | -0.298 | -0.175 |
| -0.633999999999999 | -0.625 | -0.299 | -0.175 |
| -0.631999999999999 | -0.627 | -0.3 | -0.175 |
| -0.629999999999999 | -0.629 | -0.301 | -0.176 |
| -0.627999999999999 | -0.631 | -0.301 | -0.176 |
| -0.625999999999999 | -0.634 | -0.302 | -0.176 |
| -0.623999999999999 | -0.636 | -0.303 | -0.177 |
| -0.621999999999999 | -0.638 | -0.304 | -0.177 |
| -0.619999999999999 | -0.641 | -0.304 | -0.178 |
| -0.617999999999999 | -0.643 | -0.305 | -0.178 |
| -0.615999999999999 | -0.645 | -0.306 | -0.178 |
| -0.613999999999999 | -0.648 | -0.306 | -0.179 |
| -0.611999999999999 | -0.65 | -0.307 | -0.179 |
| -0.609999999999999 | -0.652 | -0.308 | -0.179 |
| -0.607999999999999 | -0.655 | -0.309 | -0.18 |
| -0.605999999999999 | -0.657 | -0.309 | -0.18 |
| -0.603999999999999 | -0.66 | -0.31 | -0.18 |
| -0.601999999999999 | -0.662 | -0.311 | -0.181 |
| -0.599999999999999 | -0.665 | -0.312 | -0.181 |
| -0.597999999999999 | -0.667 | -0.313 | -0.181 |
| -0.595999999999999 | -0.669 | -0.313 | -0.182 |
| -0.593999999999999 | -0.672 | -0.314 | -0.182 |
| -0.591999999999999 | -0.674 | -0.315 | -0.182 |
| -0.589999999999999 | -0.677 | -0.316 | -0.183 |
| -0.587999999999999 | -0.68 | -0.316 | -0.183 |
| -0.585999999999999 | -0.682 | -0.317 | -0.184 |
| -0.583999999999999 | -0.685 | -0.318 | -0.184 |
| -0.581999999999999 | -0.687 | -0.319 | -0.184 |
| -0.579999999999999 | -0.69 | -0.32 | -0.185 |
| -0.577999999999999 | -0.692 | -0.32 | -0.185 |
| -0.575999999999999 | -0.695 | -0.321 | -0.185 |
| -0.573999999999999 | -0.698 | -0.322 | -0.186 |
| -0.571999999999999 | -0.7 | -0.323 | -0.186 |
| -0.569999999999999 | -0.703 | -0.324 | -0.186 |
| -0.567999999999999 | -0.705 | -0.324 | -0.187 |
| -0.565999999999999 | -0.708 | -0.325 | -0.187 |
| -0.563999999999999 | -0.711 | -0.326 | -0.188 |
| -0.561999999999999 | -0.713 | -0.327 | -0.188 |
| -0.559999999999999 | -0.716 | -0.328 | -0.188 |
| -0.557999999999999 | -0.719 | -0.329 | -0.189 |
| -0.555999999999999 | -0.722 | -0.329 | -0.189 |
| -0.553999999999999 | -0.724 | -0.33 | -0.19 |
| -0.551999999999999 | -0.727 | -0.331 | -0.19 |
| -0.549999999999999 | -0.73 | -0.332 | -0.19 |
| -0.547999999999999 | -0.733 | -0.333 | -0.191 |
| -0.545999999999999 | -0.736 | -0.334 | -0.191 |
| -0.543999999999999 | -0.738 | -0.334 | -0.192 |
| -0.541999999999999 | -0.741 | -0.335 | -0.192 |
| -0.539999999999999 | -0.744 | -0.336 | -0.192 |
| -0.537999999999999 | -0.747 | -0.337 | -0.193 |
| -0.535999999999999 | -0.75 | -0.338 | -0.193 |
| -0.533999999999999 | -0.753 | -0.339 | -0.194 |
| -0.531999999999999 | -0.756 | -0.34 | -0.194 |
| -0.529999999999999 | -0.759 | -0.34 | -0.194 |
| -0.527999999999999 | -0.762 | -0.341 | -0.195 |
| -0.525999999999999 | -0.765 | -0.342 | -0.195 |
| -0.523999999999999 | -0.768 | -0.343 | -0.196 |
| -0.521999999999999 | -0.771 | -0.344 | -0.196 |
| -0.519999999999999 | -0.774 | -0.345 | -0.196 |
| -0.517999999999999 | -0.777 | -0.346 | -0.197 |
| -0.515999999999999 | -0.78 | -0.347 | -0.197 |
| -0.513999999999999 | -0.783 | -0.348 | -0.198 |
| -0.511999999999999 | -0.786 | -0.349 | -0.198 |
| -0.509999999999999 | -0.789 | -0.349 | -0.198 |
| -0.507999999999999 | -0.792 | -0.35 | -0.199 |
| -0.505999999999999 | -0.795 | -0.351 | -0.199 |
| -0.503999999999999 | -0.798 | -0.352 | -0.2 |
| -0.501999999999999 | -0.802 | -0.353 | -0.2 |
| -0.499999999999999 | -0.805 | -0.354 | -0.201 |
| -0.497999999999999 | -0.808 | -0.355 | -0.201 |
| -0.495999999999999 | -0.811 | -0.356 | -0.201 |
| -0.493999999999999 | -0.814 | -0.357 | -0.202 |
| -0.491999999999999 | -0.818 | -0.358 | -0.202 |
| -0.489999999999999 | -0.821 | -0.359 | -0.203 |
| -0.487999999999999 | -0.824 | -0.36 | -0.203 |
| -0.485999999999999 | -0.828 | -0.361 | -0.204 |
| -0.483999999999999 | -0.831 | -0.362 | -0.204 |
| -0.481999999999999 | -0.834 | -0.363 | -0.205 |
| -0.479999999999999 | -0.838 | -0.364 | -0.205 |
| -0.477999999999999 | -0.841 | -0.365 | -0.205 |
| -0.475999999999999 | -0.844 | -0.366 | -0.206 |
| -0.473999999999999 | -0.848 | -0.367 | -0.206 |
| -0.471999999999999 | -0.851 | -0.368 | -0.207 |
| -0.469999999999999 | -0.855 | -0.369 | -0.207 |
| -0.467999999999999 | -0.858 | -0.37 | -0.208 |
| -0.465999999999999 | -0.862 | -0.371 | -0.208 |
| -0.463999999999999 | -0.865 | -0.372 | -0.209 |
| -0.461999999999999 | -0.869 | -0.373 | -0.209 |
| -0.459999999999999 | -0.872 | -0.374 | -0.21 |
| -0.457999999999999 | -0.876 | -0.375 | -0.21 |
| -0.455999999999999 | -0.88 | -0.376 | -0.211 |
| -0.453999999999999 | -0.883 | -0.377 | -0.211 |
| -0.451999999999999 | -0.887 | -0.378 | -0.212 |
| -0.449999999999999 | -0.891 | -0.379 | -0.212 |
| -0.447999999999999 | -0.894 | -0.38 | -0.213 |
| -0.445999999999999 | -0.898 | -0.381 | -0.213 |
| -0.443999999999999 | -0.902 | -0.382 | -0.213 |
| -0.441999999999999 | -0.906 | -0.383 | -0.214 |
| -0.439999999999999 | -0.909 | -0.384 | -0.214 |
| -0.437999999999999 | -0.913 | -0.386 | -0.215 |
| -0.435999999999999 | -0.917 | -0.387 | -0.215 |
| -0.433999999999999 | -0.921 | -0.388 | -0.216 |
| -0.431999999999999 | -0.925 | -0.389 | -0.216 |
| -0.429999999999999 | -0.929 | -0.39 | -0.217 |
| -0.427999999999999 | -0.933 | -0.391 | -0.217 |
| -0.425999999999999 | -0.937 | -0.392 | -0.218 |
| -0.423999999999999 | -0.941 | -0.393 | -0.219 |
| -0.421999999999999 | -0.945 | -0.394 | -0.219 |
| -0.419999999999999 | -0.949 | -0.396 | -0.22 |
| -0.417999999999999 | -0.953 | -0.397 | -0.22 |
| -0.415999999999999 | -0.957 | -0.398 | -0.221 |
| -0.413999999999999 | -0.961 | -0.399 | -0.221 |
| -0.411999999999999 | -0.965 | -0.4 | -0.222 |
| -0.409999999999999 | -0.969 | -0.401 | -0.222 |
| -0.407999999999999 | -0.973 | -0.403 | -0.223 |
| -0.405999999999999 | -0.978 | -0.404 | -0.223 |
| -0.403999999999999 | -0.982 | -0.405 | -0.224 |
| -0.401999999999999 | -0.986 | -0.406 | -0.224 |
| -0.399999999999999 | -0.991 | -0.407 | -0.225 |
| -0.397999999999999 | -0.995 | -0.408 | -0.225 |
| -0.395999999999999 | -0.999 | -0.41 | -0.226 |
| -0.393999999999999 | -1.004 | -0.411 | -0.227 |
| -0.391999999999999 | -1.008 | -0.412 | -0.227 |
| -0.389999999999999 | -1.012 | -0.413 | -0.228 |
| -0.387999999999999 | -1.017 | -0.415 | -0.228 |
| -0.385999999999999 | -1.021 | -0.416 | -0.229 |
| -0.383999999999999 | -1.026 | -0.417 | -0.229 |
| -0.381999999999999 | -1.03 | -0.418 | -0.23 |
| -0.379999999999999 | -1.035 | -0.42 | -0.23 |
| -0.377999999999999 | -1.04 | -0.421 | -0.231 |
| -0.375999999999999 | -1.044 | -0.422 | -0.232 |
| -0.373999999999999 | -1.049 | -0.423 | -0.232 |
| -0.371999999999999 | -1.054 | -0.425 | -0.233 |
| -0.369999999999998 | -1.058 | -0.426 | -0.233 |
| -0.367999999999998 | -1.063 | -0.427 | -0.234 |
| -0.365999999999998 | -1.068 | -0.429 | -0.235 |
| -0.363999999999998 | -1.073 | -0.43 | -0.235 |
| -0.361999999999998 | -1.078 | -0.431 | -0.236 |
| -0.359999999999998 | -1.083 | -0.433 | -0.236 |
| -0.357999999999998 | -1.088 | -0.434 | -0.237 |
| -0.355999999999998 | -1.092 | -0.435 | -0.238 |
| -0.353999999999998 | -1.097 | -0.437 | -0.238 |
| -0.351999999999998 | -1.103 | -0.438 | -0.239 |
| -0.349999999999998 | -1.108 | -0.44 | -0.239 |
| -0.347999999999998 | -1.113 | -0.441 | -0.24 |
| -0.345999999999998 | -1.118 | -0.442 | -0.241 |
| -0.343999999999998 | -1.123 | -0.444 | -0.241 |
| -0.341999999999998 | -1.128 | -0.445 | -0.242 |
| -0.339999999999998 | -1.134 | -0.447 | -0.243 |
| -0.337999999999998 | -1.139 | -0.448 | -0.243 |
| -0.335999999999998 | -1.144 | -0.449 | -0.244 |
| -0.333999999999998 | -1.149 | -0.451 | -0.245 |
| -0.331999999999998 | -1.155 | -0.452 | -0.245 |
| -0.329999999999998 | -1.16 | -0.454 | -0.246 |
| -0.327999999999998 | -1.166 | -0.455 | -0.247 |
| -0.325999999999998 | -1.171 | -0.457 | -0.247 |
| -0.323999999999998 | -1.177 | -0.458 | -0.248 |
| -0.321999999999998 | -1.183 | -0.46 | -0.249 |
| -0.319999999999998 | -1.188 | -0.461 | -0.249 |
| -0.317999999999998 | -1.194 | -0.463 | -0.25 |
| -0.315999999999998 | -1.2 | -0.464 | -0.251 |
| -0.313999999999998 | -1.205 | -0.466 | -0.251 |
| -0.311999999999998 | -1.211 | -0.467 | -0.252 |
| -0.309999999999998 | -1.217 | -0.469 | -0.253 |
| -0.307999999999998 | -1.223 | -0.471 | -0.254 |
| -0.305999999999998 | -1.229 | -0.472 | -0.254 |
| -0.303999999999998 | -1.235 | -0.474 | -0.255 |
| -0.301999999999998 | -1.241 | -0.475 | -0.256 |
| -0.299999999999998 | -1.247 | -0.477 | -0.256 |
| -0.297999999999998 | -1.253 | -0.479 | -0.257 |
| -0.295999999999998 | -1.259 | -0.48 | -0.258 |
| -0.293999999999998 | -1.266 | -0.482 | -0.259 |
| -0.291999999999998 | -1.272 | -0.484 | -0.259 |
| -0.289999999999998 | -1.278 | -0.485 | -0.26 |
| -0.287999999999998 | -1.285 | -0.487 | -0.261 |
| -0.285999999999998 | -1.291 | -0.489 | -0.262 |
| -0.283999999999998 | -1.298 | -0.49 | -0.262 |
| -0.281999999999998 | -1.304 | -0.492 | -0.263 |
| -0.279999999999998 | -1.311 | -0.494 | -0.264 |
| -0.277999999999998 | -1.317 | -0.496 | -0.265 |
| -0.275999999999998 | -1.324 | -0.497 | -0.266 |
| -0.273999999999998 | -1.331 | -0.499 | -0.266 |
| -0.271999999999998 | -1.338 | -0.501 | -0.267 |
| -0.269999999999998 | -1.345 | -0.503 | -0.268 |
| -0.267999999999998 | -1.351 | -0.505 | -0.269 |
| -0.265999999999998 | -1.358 | -0.507 | -0.27 |
| -0.263999999999998 | -1.365 | -0.508 | -0.27 |
| -0.261999999999998 | -1.373 | -0.51 | -0.271 |
| -0.259999999999998 | -1.38 | -0.512 | -0.272 |
| -0.257999999999998 | -1.387 | -0.514 | -0.273 |
| -0.255999999999998 | -1.394 | -0.516 | -0.274 |
| -0.253999999999998 | -1.402 | -0.518 | -0.275 |
| -0.251999999999998 | -1.409 | -0.52 | -0.276 |
| -0.249999999999998 | -1.417 | -0.522 | -0.276 |
| -0.247999999999998 | -1.424 | -0.524 | -0.277 |
| -0.245999999999998 | -1.432 | -0.526 | -0.278 |
| -0.243999999999998 | -1.44 | -0.528 | -0.279 |
| -0.241999999999998 | -1.447 | -0.53 | -0.28 |
| -0.239999999999998 | -1.455 | -0.532 | -0.281 |
| -0.237999999999998 | -1.463 | -0.534 | -0.282 |
| -0.235999999999998 | -1.471 | -0.536 | -0.283 |
| -0.233999999999998 | -1.479 | -0.538 | -0.284 |
| -0.231999999999998 | -1.487 | -0.54 | -0.285 |
| -0.229999999999998 | -1.495 | -0.542 | -0.286 |
| -0.227999999999998 | -1.504 | -0.545 | -0.287 |
| -0.225999999999998 | -1.512 | -0.547 | -0.288 |
| -0.223999999999998 | -1.521 | -0.549 | -0.289 |
| -0.221999999999998 | -1.529 | -0.551 | -0.29 |
| -0.219999999999998 | -1.538 | -0.553 | -0.291 |
| -0.217999999999998 | -1.546 | -0.556 | -0.292 |
| -0.215999999999998 | -1.555 | -0.558 | -0.293 |
| -0.213999999999998 | -1.564 | -0.56 | -0.294 |
| -0.211999999999998 | -1.573 | -0.562 | -0.295 |
| -0.209999999999998 | -1.582 | -0.565 | -0.296 |
| -0.207999999999998 | -1.591 | -0.567 | -0.297 |
| -0.205999999999998 | -1.601 | -0.57 | -0.298 |
| -0.203999999999998 | -1.61 | -0.572 | -0.299 |
| -0.201999999999998 | -1.619 | -0.574 | -0.3 |
| -0.199999999999998 | -1.629 | -0.577 | -0.301 |
| -0.197999999999998 | -1.639 | -0.579 | -0.302 |
| -0.195999999999998 | -1.648 | -0.582 | -0.303 |
| -0.193999999999998 | -1.658 | -0.584 | -0.305 |
| -0.191999999999998 | -1.668 | -0.587 | -0.306 |
| -0.189999999999998 | -1.678 | -0.59 | -0.307 |
| -0.187999999999998 | -1.689 | -0.592 | -0.308 |
| -0.185999999999998 | -1.699 | -0.595 | -0.309 |
| -0.183999999999998 | -1.709 | -0.598 | -0.31 |
| -0.181999999999998 | -1.72 | -0.6 | -0.312 |
| -0.179999999999998 | -1.731 | -0.603 | -0.313 |
| -0.177999999999998 | -1.742 | -0.606 | -0.314 |
| -0.175999999999998 | -1.753 | -0.609 | -0.315 |
| -0.173999999999998 | -1.764 | -0.611 | -0.317 |
| -0.171999999999998 | -1.775 | -0.614 | -0.318 |
| -0.169999999999998 | -1.786 | -0.617 | -0.319 |
| -0.167999999999998 | -1.798 | -0.62 | -0.32 |
| -0.165999999999998 | -1.809 | -0.623 | -0.322 |
| -0.163999999999998 | -1.821 | -0.626 | -0.323 |
| -0.161999999999998 | -1.833 | -0.629 | -0.324 |
| -0.159999999999998 | -1.845 | -0.632 | -0.326 |
| -0.157999999999998 | -1.857 | -0.635 | -0.327 |
| -0.155999999999998 | -1.87 | -0.639 | -0.329 |
| -0.153999999999998 | -1.883 | -0.642 | -0.33 |
| -0.151999999999998 | -1.895 | -0.645 | -0.332 |
| -0.149999999999998 | -1.908 | -0.648 | -0.333 |
| -0.147999999999998 | -1.921 | -0.652 | -0.334 |
| -0.145999999999998 | -1.935 | -0.655 | -0.336 |
| -0.143999999999998 | -1.948 | -0.658 | -0.338 |
| -0.141999999999998 | -1.962 | -0.662 | -0.339 |
| -0.139999999999998 | -1.976 | -0.665 | -0.341 |
| -0.137999999999998 | -1.99 | -0.669 | -0.342 |
| -0.135999999999998 | -2.004 | -0.673 | -0.344 |
| -0.133999999999998 | -2.019 | -0.676 | -0.346 |
| -0.131999999999998 | -2.034 | -0.68 | -0.347 |
| -0.129999999999998 | -2.049 | -0.684 | -0.349 |
| -0.127999999999998 | -2.064 | -0.688 | -0.351 |
| -0.125999999999998 | -2.079 | -0.692 | -0.352 |
| -0.123999999999998 | -2.095 | -0.696 | -0.354 |
| -0.121999999999998 | -2.111 | -0.7 | -0.356 |
| -0.119999999999998 | -2.127 | -0.704 | -0.358 |
| -0.117999999999998 | -2.144 | -0.708 | -0.36 |
| -0.115999999999998 | -2.161 | -0.712 | -0.362 |
| -0.113999999999998 | -2.178 | -0.717 | -0.363 |
| -0.111999999999998 | -2.195 | -0.721 | -0.365 |
| -0.109999999999998 | -2.213 | -0.725 | -0.367 |
| -0.107999999999998 | -2.231 | -0.73 | -0.369 |
| -0.105999999999998 | -2.25 | -0.735 | -0.372 |
| -0.103999999999998 | -2.269 | -0.739 | -0.374 |
| -0.101999999999998 | -2.288 | -0.744 | -0.376 |
| -0.0999999999999983 | -2.308 | -0.749 | -0.378 |
| -0.0979999999999983 | -2.328 | -0.754 | -0.38 |
| -0.0959999999999983 | -2.348 | -0.759 | -0.383 |
| -0.0939999999999983 | -2.369 | -0.765 | -0.385 |
| -0.0919999999999983 | -2.39 | -0.77 | -0.387 |
| -0.0899999999999983 | -2.412 | -0.776 | -0.39 |
| -0.0879999999999983 | -2.434 | -0.781 | -0.392 |
| -0.0859999999999983 | -2.457 | -0.787 | -0.395 |
| -0.0839999999999983 | -2.48 | -0.793 | -0.397 |
| -0.0819999999999983 | -2.504 | -0.799 | -0.4 |
| -0.0799999999999983 | -2.529 | -0.805 | -0.403 |
| -0.0779999999999983 | -2.554 | -0.811 | -0.406 |
| -0.0759999999999983 | -2.58 | -0.818 | -0.408 |
| -0.0739999999999983 | -2.606 | -0.824 | -0.411 |
| -0.0719999999999983 | -2.634 | -0.831 | -0.414 |
| -0.0699999999999983 | -2.662 | -0.838 | -0.418 |
| -0.0679999999999983 | -2.691 | -0.845 | -0.421 |
| -0.0659999999999983 | -2.72 | -0.853 | -0.424 |
| -0.0639999999999983 | -2.751 | -0.861 | -0.428 |
| -0.0619999999999983 | -2.783 | -0.869 | -0.431 |
| -0.0599999999999983 | -2.815 | -0.877 | -0.435 |
| -0.0579999999999983 | -2.849 | -0.885 | -0.438 |
| -0.0559999999999983 | -2.884 | -0.894 | -0.442 |
| -0.0539999999999983 | -2.92 | -0.903 | -0.446 |
| -0.0519999999999983 | -2.958 | -0.912 | -0.451 |
| -0.0499999999999983 | -2.997 | -0.922 | -0.455 |
| -0.0479999999999983 | -3.038 | -0.932 | -0.459 |
| -0.0459999999999983 | -3.08 | -0.943 | -0.464 |
| -0.0439999999999983 | -3.125 | -0.954 | -0.469 |
| -0.0419999999999983 | -3.171 | -0.966 | -0.474 |
| -0.0399999999999983 | -3.22 | -0.978 | -0.48 |
| -0.0379999999999982 | -3.271 | -0.991 | -0.485 |
| -0.0359999999999982 | -3.325 | -1.004 | -0.491 |
| -0.0339999999999982 | -3.382 | -1.019 | -0.498 |
| -0.0319999999999982 | -3.443 | -1.034 | -0.505 |
| -0.0299999999999982 | -3.507 | -1.05 | -0.512 |
| -0.0279999999999982 | -3.576 | -1.067 | -0.519 |
| -0.0259999999999982 | -3.65 | -1.086 | -0.528 |
| -0.0239999999999982 | -3.73 | -1.106 | -0.536 |
| -0.0219999999999982 | -3.817 | -1.127 | -0.546 |
| -0.0199999999999982 | -3.912 | -1.151 | -0.557 |
| -0.0179999999999982 | -4.018 | -1.178 | -0.568 |
| -0.0159999999999982 | -4.135 | -1.207 | -0.582 |
| -0.0139999999999982 | -4.269 | -1.24 | -0.596 |
| -0.0119999999999982 | -4.423 | -1.279 | -0.613 |
| -0.00999999999999823 | -4.605 | -1.325 | -0.634 |
| -0.00799999999999824 | -4.828 | -1.38 | -0.659 |
| -0.00599999999999824 | -5.116 | -1.452 | -0.691 |
| -0.00399999999999824 | -5.521 | -1.554 | -0.736 |
| -0.00199999999999824 | -6.215 | -1.727 | -0.813 |
| 1.76247905159244e-15 | -33.972 | -8.666 | -3.897 |
| 0.00200000000000176 | -6.215 | -1.727 | -0.813 |
| 0.00400000000000176 | -5.521 | -1.554 | -0.736 |
| 0.00600000000000176 | -5.116 | -1.452 | -0.691 |
| 0.00800000000000176 | -4.828 | -1.38 | -0.659 |
| 0.0100000000000018 | -4.605 | -1.325 | -0.634 |
| 0.0120000000000018 | -4.423 | -1.279 | -0.613 |
| 0.0140000000000018 | -4.269 | -1.24 | -0.596 |
| 0.0160000000000018 | -4.135 | -1.207 | -0.582 |
| 0.0180000000000018 | -4.018 | -1.178 | -0.568 |
| 0.0200000000000018 | -3.912 | -1.151 | -0.557 |
| 0.0220000000000018 | -3.817 | -1.127 | -0.546 |
| 0.0240000000000018 | -3.73 | -1.106 | -0.536 |
| 0.0260000000000018 | -3.65 | -1.086 | -0.528 |
| 0.0280000000000018 | -3.576 | -1.067 | -0.519 |
| 0.0300000000000018 | -3.507 | -1.05 | -0.512 |
| 0.0320000000000018 | -3.443 | -1.034 | -0.505 |
| 0.0340000000000018 | -3.382 | -1.019 | -0.498 |
| 0.0360000000000018 | -3.325 | -1.004 | -0.491 |
| 0.0380000000000018 | -3.271 | -0.991 | -0.485 |
| 0.0400000000000018 | -3.22 | -0.978 | -0.48 |
| 0.0420000000000018 | -3.171 | -0.966 | -0.474 |
| 0.0440000000000018 | -3.125 | -0.954 | -0.469 |
| 0.0460000000000018 | -3.08 | -0.943 | -0.464 |
| 0.0480000000000018 | -3.038 | -0.932 | -0.459 |
| 0.0500000000000018 | -2.997 | -0.922 | -0.455 |
| 0.0520000000000018 | -2.958 | -0.912 | -0.451 |
| 0.0540000000000018 | -2.92 | -0.903 | -0.446 |
| 0.0560000000000018 | -2.884 | -0.894 | -0.442 |
| 0.0580000000000018 | -2.849 | -0.885 | -0.438 |
| 0.0600000000000018 | -2.815 | -0.877 | -0.435 |
| 0.0620000000000018 | -2.783 | -0.869 | -0.431 |
| 0.0640000000000018 | -2.751 | -0.861 | -0.428 |
| 0.0660000000000018 | -2.72 | -0.853 | -0.424 |
| 0.0680000000000018 | -2.691 | -0.845 | -0.421 |
| 0.0700000000000018 | -2.662 | -0.838 | -0.418 |
| 0.0720000000000018 | -2.634 | -0.831 | -0.414 |
| 0.0740000000000018 | -2.606 | -0.824 | -0.411 |
| 0.0760000000000018 | -2.58 | -0.818 | -0.408 |
| 0.0780000000000018 | -2.554 | -0.811 | -0.406 |
| 0.0800000000000018 | -2.529 | -0.805 | -0.403 |
| 0.0820000000000018 | -2.504 | -0.799 | -0.4 |
| 0.0840000000000018 | -2.48 | -0.793 | -0.397 |
| 0.0860000000000018 | -2.457 | -0.787 | -0.395 |
| 0.0880000000000018 | -2.434 | -0.781 | -0.392 |
| 0.0900000000000018 | -2.412 | -0.776 | -0.39 |
| 0.0920000000000018 | -2.39 | -0.77 | -0.387 |
| 0.0940000000000018 | -2.369 | -0.765 | -0.385 |
| 0.0960000000000018 | -2.348 | -0.759 | -0.383 |
| 0.0980000000000018 | -2.328 | -0.754 | -0.38 |
| 0.100000000000002 | -2.308 | -0.749 | -0.378 |
| 0.102000000000002 | -2.288 | -0.744 | -0.376 |
| 0.104000000000002 | -2.269 | -0.739 | -0.374 |
| 0.106000000000002 | -2.25 | -0.735 | -0.372 |
| 0.108000000000002 | -2.231 | -0.73 | -0.369 |
| 0.110000000000002 | -2.213 | -0.725 | -0.367 |
| 0.112000000000002 | -2.195 | -0.721 | -0.365 |
| 0.114000000000002 | -2.178 | -0.717 | -0.363 |
| 0.116000000000002 | -2.161 | -0.712 | -0.362 |
| 0.118000000000002 | -2.144 | -0.708 | -0.36 |
| 0.120000000000002 | -2.127 | -0.704 | -0.358 |
| 0.122000000000002 | -2.111 | -0.7 | -0.356 |
| 0.124000000000002 | -2.095 | -0.696 | -0.354 |
| 0.126000000000002 | -2.079 | -0.692 | -0.352 |
| 0.128000000000002 | -2.064 | -0.688 | -0.351 |
| 0.130000000000002 | -2.049 | -0.684 | -0.349 |
| 0.132000000000002 | -2.034 | -0.68 | -0.347 |
| 0.134000000000002 | -2.019 | -0.676 | -0.346 |
| 0.136000000000002 | -2.004 | -0.673 | -0.344 |
| 0.138000000000002 | -1.99 | -0.669 | -0.342 |
| 0.140000000000002 | -1.976 | -0.665 | -0.341 |
| 0.142000000000002 | -1.962 | -0.662 | -0.339 |
| 0.144000000000002 | -1.948 | -0.658 | -0.338 |
| 0.146000000000002 | -1.935 | -0.655 | -0.336 |
| 0.148000000000002 | -1.921 | -0.652 | -0.334 |
| 0.150000000000002 | -1.908 | -0.648 | -0.333 |
| 0.152000000000002 | -1.895 | -0.645 | -0.332 |
| 0.154000000000002 | -1.883 | -0.642 | -0.33 |
| 0.156000000000002 | -1.87 | -0.639 | -0.329 |
| 0.158000000000002 | -1.857 | -0.635 | -0.327 |
| 0.160000000000002 | -1.845 | -0.632 | -0.326 |
| 0.162000000000002 | -1.833 | -0.629 | -0.324 |
| 0.164000000000002 | -1.821 | -0.626 | -0.323 |
| 0.166000000000002 | -1.809 | -0.623 | -0.322 |
| 0.168000000000002 | -1.798 | -0.62 | -0.32 |
| 0.170000000000002 | -1.786 | -0.617 | -0.319 |
| 0.172000000000002 | -1.775 | -0.614 | -0.318 |
| 0.174000000000002 | -1.764 | -0.611 | -0.317 |
| 0.176000000000002 | -1.753 | -0.609 | -0.315 |
| 0.178000000000002 | -1.742 | -0.606 | -0.314 |
| 0.180000000000002 | -1.731 | -0.603 | -0.313 |
| 0.182000000000002 | -1.72 | -0.6 | -0.312 |
| 0.184000000000002 | -1.709 | -0.598 | -0.31 |
| 0.186000000000002 | -1.699 | -0.595 | -0.309 |
| 0.188000000000002 | -1.689 | -0.592 | -0.308 |
| 0.190000000000002 | -1.678 | -0.59 | -0.307 |
| 0.192000000000002 | -1.668 | -0.587 | -0.306 |
| 0.194000000000002 | -1.658 | -0.584 | -0.305 |
| 0.196000000000002 | -1.648 | -0.582 | -0.303 |
| 0.198000000000002 | -1.639 | -0.579 | -0.302 |
| 0.200000000000002 | -1.629 | -0.577 | -0.301 |
| 0.202000000000002 | -1.619 | -0.574 | -0.3 |
| 0.204000000000002 | -1.61 | -0.572 | -0.299 |
| 0.206000000000002 | -1.601 | -0.57 | -0.298 |
| 0.208000000000002 | -1.591 | -0.567 | -0.297 |
| 0.210000000000002 | -1.582 | -0.565 | -0.296 |
| 0.212000000000002 | -1.573 | -0.562 | -0.295 |
| 0.214000000000002 | -1.564 | -0.56 | -0.294 |
| 0.216000000000002 | -1.555 | -0.558 | -0.293 |
| 0.218000000000002 | -1.546 | -0.556 | -0.292 |
| 0.220000000000002 | -1.538 | -0.553 | -0.291 |
| 0.222000000000002 | -1.529 | -0.551 | -0.29 |
| 0.224000000000002 | -1.521 | -0.549 | -0.289 |
| 0.226000000000002 | -1.512 | -0.547 | -0.288 |
| 0.228000000000002 | -1.504 | -0.545 | -0.287 |
| 0.230000000000002 | -1.495 | -0.542 | -0.286 |
| 0.232000000000002 | -1.487 | -0.54 | -0.285 |
| 0.234000000000002 | -1.479 | -0.538 | -0.284 |
| 0.236000000000002 | -1.471 | -0.536 | -0.283 |
| 0.238000000000002 | -1.463 | -0.534 | -0.282 |
| 0.240000000000002 | -1.455 | -0.532 | -0.281 |
| 0.242000000000002 | -1.447 | -0.53 | -0.28 |
| 0.244000000000002 | -1.44 | -0.528 | -0.279 |
| 0.246000000000002 | -1.432 | -0.526 | -0.278 |
| 0.248000000000002 | -1.424 | -0.524 | -0.277 |
| 0.250000000000002 | -1.417 | -0.522 | -0.276 |
| 0.252000000000002 | -1.409 | -0.52 | -0.276 |
| 0.254000000000002 | -1.402 | -0.518 | -0.275 |
| 0.256000000000002 | -1.394 | -0.516 | -0.274 |
| 0.258000000000002 | -1.387 | -0.514 | -0.273 |
| 0.260000000000002 | -1.38 | -0.512 | -0.272 |
| 0.262000000000002 | -1.373 | -0.51 | -0.271 |
| 0.264000000000002 | -1.365 | -0.508 | -0.27 |
| 0.266000000000002 | -1.358 | -0.507 | -0.27 |
| 0.268000000000002 | -1.351 | -0.505 | -0.269 |
| 0.270000000000002 | -1.345 | -0.503 | -0.268 |
| 0.272000000000002 | -1.338 | -0.501 | -0.267 |
| 0.274000000000002 | -1.331 | -0.499 | -0.266 |
| 0.276000000000002 | -1.324 | -0.497 | -0.266 |
| 0.278000000000002 | -1.317 | -0.496 | -0.265 |
| 0.280000000000002 | -1.311 | -0.494 | -0.264 |
| 0.282000000000002 | -1.304 | -0.492 | -0.263 |
| 0.284000000000002 | -1.298 | -0.49 | -0.262 |
| 0.286000000000002 | -1.291 | -0.489 | -0.262 |
| 0.288000000000002 | -1.285 | -0.487 | -0.261 |
| 0.290000000000002 | -1.278 | -0.485 | -0.26 |
| 0.292000000000002 | -1.272 | -0.484 | -0.259 |
| 0.294000000000002 | -1.266 | -0.482 | -0.259 |
| 0.296000000000002 | -1.259 | -0.48 | -0.258 |
| 0.298000000000002 | -1.253 | -0.479 | -0.257 |
| 0.300000000000002 | -1.247 | -0.477 | -0.256 |
| 0.302000000000002 | -1.241 | -0.475 | -0.256 |
| 0.304000000000002 | -1.235 | -0.474 | -0.255 |
| 0.306000000000002 | -1.229 | -0.472 | -0.254 |
| 0.308000000000002 | -1.223 | -0.471 | -0.254 |
| 0.310000000000002 | -1.217 | -0.469 | -0.253 |
| 0.312000000000002 | -1.211 | -0.467 | -0.252 |
| 0.314000000000002 | -1.205 | -0.466 | -0.251 |
| 0.316000000000002 | -1.2 | -0.464 | -0.251 |
| 0.318000000000002 | -1.194 | -0.463 | -0.25 |
| 0.320000000000002 | -1.188 | -0.461 | -0.249 |
| 0.322000000000002 | -1.183 | -0.46 | -0.249 |
| 0.324000000000002 | -1.177 | -0.458 | -0.248 |
| 0.326000000000002 | -1.171 | -0.457 | -0.247 |
| 0.328000000000002 | -1.166 | -0.455 | -0.247 |
| 0.330000000000002 | -1.16 | -0.454 | -0.246 |
| 0.332000000000002 | -1.155 | -0.452 | -0.245 |
| 0.334000000000002 | -1.149 | -0.451 | -0.245 |
| 0.336000000000002 | -1.144 | -0.449 | -0.244 |
| 0.338000000000002 | -1.139 | -0.448 | -0.243 |
| 0.340000000000002 | -1.134 | -0.447 | -0.243 |
| 0.342000000000002 | -1.128 | -0.445 | -0.242 |
| 0.344000000000002 | -1.123 | -0.444 | -0.241 |
| 0.346000000000002 | -1.118 | -0.442 | -0.241 |
| 0.348000000000002 | -1.113 | -0.441 | -0.24 |
| 0.350000000000002 | -1.108 | -0.44 | -0.239 |
| 0.352000000000002 | -1.103 | -0.438 | -0.239 |
| 0.354000000000002 | -1.097 | -0.437 | -0.238 |
| 0.356000000000002 | -1.092 | -0.435 | -0.238 |
| 0.358000000000002 | -1.088 | -0.434 | -0.237 |
| 0.360000000000002 | -1.083 | -0.433 | -0.236 |
| 0.362000000000002 | -1.078 | -0.431 | -0.236 |
| 0.364000000000002 | -1.073 | -0.43 | -0.235 |
| 0.366000000000002 | -1.068 | -0.429 | -0.235 |
| 0.368000000000002 | -1.063 | -0.427 | -0.234 |
| 0.370000000000002 | -1.058 | -0.426 | -0.233 |
| 0.372000000000002 | -1.054 | -0.425 | -0.233 |
| 0.374000000000002 | -1.049 | -0.423 | -0.232 |
| 0.376000000000002 | -1.044 | -0.422 | -0.232 |
| 0.378000000000002 | -1.04 | -0.421 | -0.231 |
| 0.380000000000002 | -1.035 | -0.42 | -0.23 |
| 0.382000000000002 | -1.03 | -0.418 | -0.23 |
| 0.384000000000002 | -1.026 | -0.417 | -0.229 |
| 0.386000000000002 | -1.021 | -0.416 | -0.229 |
| 0.388000000000002 | -1.017 | -0.415 | -0.228 |
| 0.390000000000002 | -1.012 | -0.413 | -0.228 |
| 0.392000000000002 | -1.008 | -0.412 | -0.227 |
| 0.394000000000002 | -1.004 | -0.411 | -0.227 |
| 0.396000000000002 | -0.999 | -0.41 | -0.226 |
| 0.398000000000002 | -0.995 | -0.408 | -0.225 |
| 0.400000000000002 | -0.991 | -0.407 | -0.225 |
| 0.402000000000002 | -0.986 | -0.406 | -0.224 |
| 0.404000000000002 | -0.982 | -0.405 | -0.224 |
| 0.406000000000002 | -0.978 | -0.404 | -0.223 |
| 0.408000000000002 | -0.973 | -0.403 | -0.223 |
| 0.410000000000002 | -0.969 | -0.401 | -0.222 |
| 0.412000000000002 | -0.965 | -0.4 | -0.222 |
| 0.414000000000002 | -0.961 | -0.399 | -0.221 |
| 0.416000000000002 | -0.957 | -0.398 | -0.221 |
| 0.418000000000002 | -0.953 | -0.397 | -0.22 |
| 0.420000000000002 | -0.949 | -0.396 | -0.22 |
| 0.422000000000002 | -0.945 | -0.394 | -0.219 |
| 0.424000000000002 | -0.941 | -0.393 | -0.219 |
| 0.426000000000002 | -0.937 | -0.392 | -0.218 |
| 0.428000000000002 | -0.933 | -0.391 | -0.217 |
| 0.430000000000002 | -0.929 | -0.39 | -0.217 |
| 0.432000000000002 | -0.925 | -0.389 | -0.216 |
| 0.434000000000002 | -0.921 | -0.388 | -0.216 |
| 0.436000000000002 | -0.917 | -0.387 | -0.215 |
| 0.438000000000002 | -0.913 | -0.386 | -0.215 |
| 0.440000000000002 | -0.909 | -0.384 | -0.214 |
| 0.442000000000002 | -0.906 | -0.383 | -0.214 |
| 0.444000000000002 | -0.902 | -0.382 | -0.213 |
| 0.446000000000002 | -0.898 | -0.381 | -0.213 |
| 0.448000000000002 | -0.894 | -0.38 | -0.213 |
| 0.450000000000002 | -0.891 | -0.379 | -0.212 |
| 0.452000000000002 | -0.887 | -0.378 | -0.212 |
| 0.454000000000002 | -0.883 | -0.377 | -0.211 |
| 0.456000000000002 | -0.88 | -0.376 | -0.211 |
| 0.458000000000002 | -0.876 | -0.375 | -0.21 |
| 0.460000000000002 | -0.872 | -0.374 | -0.21 |
| 0.462000000000002 | -0.869 | -0.373 | -0.209 |
| 0.464000000000002 | -0.865 | -0.372 | -0.209 |
| 0.466000000000002 | -0.862 | -0.371 | -0.208 |
| 0.468000000000002 | -0.858 | -0.37 | -0.208 |
| 0.470000000000002 | -0.855 | -0.369 | -0.207 |
| 0.472000000000002 | -0.851 | -0.368 | -0.207 |
| 0.474000000000002 | -0.848 | -0.367 | -0.206 |
| 0.476000000000002 | -0.844 | -0.366 | -0.206 |
| 0.478000000000002 | -0.841 | -0.365 | -0.205 |
| 0.480000000000002 | -0.838 | -0.364 | -0.205 |
| 0.482000000000002 | -0.834 | -0.363 | -0.205 |
| 0.484000000000002 | -0.831 | -0.362 | -0.204 |
| 0.486000000000002 | -0.828 | -0.361 | -0.204 |
| 0.488000000000002 | -0.824 | -0.36 | -0.203 |
| 0.490000000000002 | -0.821 | -0.359 | -0.203 |
| 0.492000000000002 | -0.818 | -0.358 | -0.202 |
| 0.494000000000002 | -0.814 | -0.357 | -0.202 |
| 0.496000000000002 | -0.811 | -0.356 | -0.201 |
| 0.498000000000002 | -0.808 | -0.355 | -0.201 |
| 0.500000000000002 | -0.805 | -0.354 | -0.201 |
| 0.502000000000002 | -0.802 | -0.353 | -0.2 |
| 0.504000000000002 | -0.798 | -0.352 | -0.2 |
| 0.506000000000002 | -0.795 | -0.351 | -0.199 |
| 0.508000000000002 | -0.792 | -0.35 | -0.199 |
| 0.510000000000002 | -0.789 | -0.349 | -0.198 |
| 0.512000000000002 | -0.786 | -0.349 | -0.198 |
| 0.514000000000002 | -0.783 | -0.348 | -0.198 |
| 0.516000000000002 | -0.78 | -0.347 | -0.197 |
| 0.518000000000002 | -0.777 | -0.346 | -0.197 |
| 0.520000000000002 | -0.774 | -0.345 | -0.196 |
| 0.522000000000002 | -0.771 | -0.344 | -0.196 |
| 0.524000000000002 | -0.768 | -0.343 | -0.196 |
| 0.526000000000002 | -0.765 | -0.342 | -0.195 |
| 0.528000000000002 | -0.762 | -0.341 | -0.195 |
| 0.530000000000002 | -0.759 | -0.34 | -0.194 |
| 0.532000000000002 | -0.756 | -0.34 | -0.194 |
| 0.534000000000002 | -0.753 | -0.339 | -0.194 |
| 0.536000000000002 | -0.75 | -0.338 | -0.193 |
| 0.538000000000002 | -0.747 | -0.337 | -0.193 |
| 0.540000000000002 | -0.744 | -0.336 | -0.192 |
| 0.542000000000002 | -0.741 | -0.335 | -0.192 |
| 0.544000000000002 | -0.738 | -0.334 | -0.192 |
| 0.546000000000002 | -0.736 | -0.334 | -0.191 |
| 0.548000000000002 | -0.733 | -0.333 | -0.191 |
| 0.550000000000002 | -0.73 | -0.332 | -0.19 |
| 0.552000000000002 | -0.727 | -0.331 | -0.19 |
| 0.554000000000002 | -0.724 | -0.33 | -0.19 |
| 0.556000000000002 | -0.722 | -0.329 | -0.189 |
| 0.558000000000002 | -0.719 | -0.329 | -0.189 |
| 0.560000000000002 | -0.716 | -0.328 | -0.188 |
| 0.562000000000002 | -0.713 | -0.327 | -0.188 |
| 0.564000000000002 | -0.711 | -0.326 | -0.188 |
| 0.566000000000002 | -0.708 | -0.325 | -0.187 |
| 0.568000000000002 | -0.705 | -0.324 | -0.187 |
| 0.570000000000002 | -0.703 | -0.324 | -0.186 |
| 0.572000000000002 | -0.7 | -0.323 | -0.186 |
| 0.574000000000002 | -0.698 | -0.322 | -0.186 |
| 0.576000000000002 | -0.695 | -0.321 | -0.185 |
| 0.578000000000002 | -0.692 | -0.32 | -0.185 |
| 0.580000000000002 | -0.69 | -0.32 | -0.185 |
| 0.582000000000002 | -0.687 | -0.319 | -0.184 |
| 0.584000000000002 | -0.685 | -0.318 | -0.184 |
| 0.586000000000002 | -0.682 | -0.317 | -0.184 |
| 0.588000000000002 | -0.68 | -0.316 | -0.183 |
| 0.590000000000002 | -0.677 | -0.316 | -0.183 |
| 0.592000000000002 | -0.674 | -0.315 | -0.182 |
| 0.594000000000002 | -0.672 | -0.314 | -0.182 |
| 0.596000000000002 | -0.669 | -0.313 | -0.182 |
| 0.598000000000002 | -0.667 | -0.313 | -0.181 |
| 0.600000000000002 | -0.665 | -0.312 | -0.181 |
| 0.602000000000002 | -0.662 | -0.311 | -0.181 |
| 0.604000000000002 | -0.66 | -0.31 | -0.18 |
| 0.606000000000002 | -0.657 | -0.309 | -0.18 |
| 0.608000000000002 | -0.655 | -0.309 | -0.18 |
| 0.610000000000002 | -0.652 | -0.308 | -0.179 |
| 0.612000000000002 | -0.65 | -0.307 | -0.179 |
| 0.614000000000002 | -0.648 | -0.306 | -0.179 |
| 0.616000000000002 | -0.645 | -0.306 | -0.178 |
| 0.618000000000002 | -0.643 | -0.305 | -0.178 |
| 0.620000000000002 | -0.641 | -0.304 | -0.178 |
| 0.622000000000002 | -0.638 | -0.304 | -0.177 |
| 0.624000000000002 | -0.636 | -0.303 | -0.177 |
| 0.626000000000002 | -0.634 | -0.302 | -0.176 |
| 0.628000000000002 | -0.631 | -0.301 | -0.176 |
| 0.630000000000002 | -0.629 | -0.301 | -0.176 |
| 0.632000000000002 | -0.627 | -0.3 | -0.175 |
| 0.634000000000002 | -0.625 | -0.299 | -0.175 |
| 0.636000000000002 | -0.622 | -0.298 | -0.175 |
| 0.638000000000002 | -0.62 | -0.298 | -0.174 |
| 0.640000000000002 | -0.618 | -0.297 | -0.174 |
| 0.642000000000002 | -0.616 | -0.296 | -0.174 |
| 0.644000000000002 | -0.614 | -0.296 | -0.173 |
| 0.646000000000002 | -0.611 | -0.295 | -0.173 |
| 0.648000000000002 | -0.609 | -0.294 | -0.173 |
| 0.650000000000002 | -0.607 | -0.294 | -0.172 |
| 0.652000000000002 | -0.605 | -0.293 | -0.172 |
| 0.654000000000002 | -0.603 | -0.292 | -0.172 |
| 0.656000000000002 | -0.601 | -0.291 | -0.172 |
| 0.658000000000002 | -0.598 | -0.291 | -0.171 |
| 0.660000000000002 | -0.596 | -0.29 | -0.171 |
| 0.662000000000002 | -0.594 | -0.289 | -0.171 |
| 0.664000000000002 | -0.592 | -0.289 | -0.17 |
| 0.666000000000002 | -0.59 | -0.288 | -0.17 |
| 0.668000000000002 | -0.588 | -0.287 | -0.17 |
| 0.670000000000002 | -0.586 | -0.287 | -0.169 |
| 0.672000000000002 | -0.584 | -0.286 | -0.169 |
| 0.674000000000002 | -0.582 | -0.285 | -0.169 |
| 0.676000000000002 | -0.58 | -0.285 | -0.168 |
| 0.678000000000002 | -0.578 | -0.284 | -0.168 |
| 0.680000000000002 | -0.576 | -0.283 | -0.168 |
| 0.682000000000002 | -0.574 | -0.283 | -0.167 |
| 0.684000000000002 | -0.572 | -0.282 | -0.167 |
| 0.686000000000002 | -0.57 | -0.281 | -0.167 |
| 0.688000000000002 | -0.568 | -0.281 | -0.166 |
| 0.690000000000002 | -0.566 | -0.28 | -0.166 |
| 0.692000000000002 | -0.564 | -0.279 | -0.166 |
| 0.694000000000002 | -0.562 | -0.279 | -0.166 |
| 0.696000000000002 | -0.56 | -0.278 | -0.165 |
| 0.698000000000002 | -0.558 | -0.278 | -0.165 |
| 0.700000000000002 | -0.556 | -0.277 | -0.165 |
| 0.702000000000002 | -0.554 | -0.276 | -0.164 |
| 0.704000000000002 | -0.552 | -0.276 | -0.164 |
| 0.706000000000002 | -0.55 | -0.275 | -0.164 |
| 0.708000000000002 | -0.548 | -0.274 | -0.163 |
| 0.710000000000002 | -0.547 | -0.274 | -0.163 |
| 0.712000000000002 | -0.545 | -0.273 | -0.163 |
| 0.714000000000002 | -0.543 | -0.272 | -0.163 |
| 0.716000000000002 | -0.541 | -0.272 | -0.162 |
| 0.718000000000002 | -0.539 | -0.271 | -0.162 |
| 0.720000000000002 | -0.537 | -0.271 | -0.162 |
| 0.722000000000002 | -0.536 | -0.27 | -0.161 |
| 0.724000000000002 | -0.534 | -0.269 | -0.161 |
| 0.726000000000002 | -0.532 | -0.269 | -0.161 |
| 0.728000000000002 | -0.53 | -0.268 | -0.161 |
| 0.730000000000002 | -0.528 | -0.268 | -0.16 |
| 0.732000000000002 | -0.527 | -0.267 | -0.16 |
| 0.734000000000002 | -0.525 | -0.266 | -0.16 |
| 0.736000000000002 | -0.523 | -0.266 | -0.159 |
| 0.738000000000002 | -0.521 | -0.265 | -0.159 |
| 0.740000000000002 | -0.519 | -0.265 | -0.159 |
| 0.742000000000002 | -0.518 | -0.264 | -0.159 |
| 0.744000000000002 | -0.516 | -0.263 | -0.158 |
| 0.746000000000002 | -0.514 | -0.263 | -0.158 |
| 0.748000000000002 | -0.513 | -0.262 | -0.158 |
| 0.750000000000002 | -0.511 | -0.262 | -0.157 |
| 0.752000000000002 | -0.509 | -0.261 | -0.157 |
| 0.754000000000002 | -0.507 | -0.26 | -0.157 |
| 0.756000000000002 | -0.506 | -0.26 | -0.157 |
| 0.758000000000002 | -0.504 | -0.259 | -0.156 |
| 0.760000000000002 | -0.502 | -0.259 | -0.156 |
| 0.762000000000002 | -0.501 | -0.258 | -0.156 |
| 0.764000000000002 | -0.499 | -0.258 | -0.155 |
| 0.766000000000002 | -0.497 | -0.257 | -0.155 |
| 0.768000000000002 | -0.496 | -0.256 | -0.155 |
| 0.770000000000002 | -0.494 | -0.256 | -0.155 |
| 0.772000000000002 | -0.493 | -0.255 | -0.154 |
| 0.774000000000002 | -0.491 | -0.255 | -0.154 |
| 0.776000000000002 | -0.489 | -0.254 | -0.154 |
| 0.778000000000002 | -0.488 | -0.254 | -0.154 |
| 0.780000000000002 | -0.486 | -0.253 | -0.153 |
| 0.782000000000002 | -0.484 | -0.253 | -0.153 |
| 0.784000000000002 | -0.483 | -0.252 | -0.153 |
| 0.786000000000002 | -0.481 | -0.251 | -0.153 |
| 0.788000000000002 | -0.48 | -0.251 | -0.152 |
| 0.790000000000002 | -0.478 | -0.25 | -0.152 |
| 0.792000000000002 | -0.477 | -0.25 | -0.152 |
| 0.794000000000002 | -0.475 | -0.249 | -0.151 |
| 0.796000000000002 | -0.474 | -0.249 | -0.151 |
| 0.798000000000002 | -0.472 | -0.248 | -0.151 |
| 0.800000000000002 | -0.47 | -0.248 | -0.151 |
| 0.802000000000002 | -0.469 | -0.247 | -0.15 |
| 0.804000000000002 | -0.467 | -0.247 | -0.15 |
| 0.806000000000002 | -0.466 | -0.246 | -0.15 |
| 0.808000000000002 | -0.464 | -0.245 | -0.15 |
| 0.810000000000002 | -0.463 | -0.245 | -0.149 |
| 0.812000000000002 | -0.461 | -0.244 | -0.149 |
| 0.814000000000002 | -0.46 | -0.244 | -0.149 |
| 0.816000000000002 | -0.459 | -0.243 | -0.149 |
| 0.818000000000002 | -0.457 | -0.243 | -0.148 |
| 0.820000000000002 | -0.456 | -0.242 | -0.148 |
| 0.822000000000002 | -0.454 | -0.242 | -0.148 |
| 0.824000000000002 | -0.453 | -0.241 | -0.148 |
| 0.826000000000002 | -0.451 | -0.241 | -0.147 |
| 0.828000000000002 | -0.45 | -0.24 | -0.147 |
| 0.830000000000002 | -0.448 | -0.24 | -0.147 |
| 0.832000000000002 | -0.447 | -0.239 | -0.147 |
| 0.834000000000002 | -0.446 | -0.239 | -0.146 |
| 0.836000000000002 | -0.444 | -0.238 | -0.146 |
| 0.838000000000002 | -0.443 | -0.238 | -0.146 |
| 0.840000000000002 | -0.441 | -0.237 | -0.146 |
| 0.842000000000002 | -0.44 | -0.237 | -0.145 |
| 0.844000000000002 | -0.439 | -0.236 | -0.145 |
| 0.846000000000002 | -0.437 | -0.236 | -0.145 |
| 0.848000000000002 | -0.436 | -0.235 | -0.145 |
| 0.850000000000002 | -0.434 | -0.235 | -0.144 |
| 0.852000000000002 | -0.433 | -0.234 | -0.144 |
| 0.854000000000002 | -0.432 | -0.234 | -0.144 |
| 0.856000000000002 | -0.43 | -0.233 | -0.144 |
| 0.858000000000002 | -0.429 | -0.233 | -0.143 |
| 0.860000000000002 | -0.428 | -0.232 | -0.143 |
| 0.862000000000002 | -0.426 | -0.232 | -0.143 |
| 0.864000000000002 | -0.425 | -0.231 | -0.143 |
| 0.866000000000002 | -0.424 | -0.231 | -0.143 |
| 0.868000000000002 | -0.422 | -0.23 | -0.142 |
| 0.870000000000002 | -0.421 | -0.23 | -0.142 |
| 0.872000000000002 | -0.42 | -0.229 | -0.142 |
| 0.874000000000002 | -0.418 | -0.229 | -0.142 |
| 0.876000000000002 | -0.417 | -0.228 | -0.141 |
| 0.878000000000002 | -0.416 | -0.228 | -0.141 |
| 0.880000000000002 | -0.415 | -0.227 | -0.141 |
| 0.882000000000002 | -0.413 | -0.227 | -0.141 |
| 0.884000000000002 | -0.412 | -0.226 | -0.14 |
| 0.886000000000002 | -0.411 | -0.226 | -0.14 |
| 0.888000000000002 | -0.409 | -0.225 | -0.14 |
| 0.890000000000002 | -0.408 | -0.225 | -0.14 |
| 0.892000000000002 | -0.407 | -0.225 | -0.139 |
| 0.894000000000002 | -0.406 | -0.224 | -0.139 |
| 0.896000000000002 | -0.404 | -0.224 | -0.139 |
| 0.898000000000002 | -0.403 | -0.223 | -0.139 |
| 0.900000000000002 | -0.402 | -0.223 | -0.139 |
| 0.902000000000002 | -0.401 | -0.222 | -0.138 |
| 0.904000000000002 | -0.4 | -0.222 | -0.138 |
| 0.906000000000002 | -0.398 | -0.221 | -0.138 |
| 0.908000000000002 | -0.397 | -0.221 | -0.138 |
| 0.910000000000002 | -0.396 | -0.22 | -0.137 |
| 0.912000000000002 | -0.395 | -0.22 | -0.137 |
| 0.914000000000002 | -0.394 | -0.219 | -0.137 |
| 0.916000000000002 | -0.392 | -0.219 | -0.137 |
| 0.918000000000002 | -0.391 | -0.219 | -0.137 |
| 0.920000000000002 | -0.39 | -0.218 | -0.136 |
| 0.922000000000002 | -0.389 | -0.218 | -0.136 |
| 0.924000000000002 | -0.388 | -0.217 | -0.136 |
| 0.926000000000002 | -0.386 | -0.217 | -0.136 |
| 0.928000000000002 | -0.385 | -0.216 | -0.135 |
| 0.930000000000002 | -0.384 | -0.216 | -0.135 |
| 0.932000000000002 | -0.383 | -0.215 | -0.135 |
| 0.934000000000002 | -0.382 | -0.215 | -0.135 |
| 0.936000000000002 | -0.381 | -0.215 | -0.135 |
| 0.938000000000002 | -0.38 | -0.214 | -0.134 |
| 0.940000000000002 | -0.378 | -0.214 | -0.134 |
| 0.942000000000002 | -0.377 | -0.213 | -0.134 |
| 0.944000000000002 | -0.376 | -0.213 | -0.134 |
| 0.946000000000002 | -0.375 | -0.212 | -0.134 |
| 0.948000000000002 | -0.374 | -0.212 | -0.133 |
| 0.950000000000002 | -0.373 | -0.212 | -0.133 |
| 0.952000000000002 | -0.372 | -0.211 | -0.133 |
| 0.954000000000002 | -0.371 | -0.211 | -0.133 |
| 0.956000000000002 | -0.37 | -0.21 | -0.132 |
| 0.958000000000002 | -0.368 | -0.21 | -0.132 |
| 0.960000000000002 | -0.367 | -0.209 | -0.132 |
| 0.962000000000002 | -0.366 | -0.209 | -0.132 |
| 0.964000000000002 | -0.365 | -0.209 | -0.132 |
| 0.966000000000002 | -0.364 | -0.208 | -0.131 |
| 0.968000000000002 | -0.363 | -0.208 | -0.131 |
| 0.970000000000002 | -0.362 | -0.207 | -0.131 |
| 0.972000000000002 | -0.361 | -0.207 | -0.131 |
| 0.974000000000003 | -0.36 | -0.206 | -0.131 |
| 0.976000000000003 | -0.359 | -0.206 | -0.13 |
| 0.978000000000003 | -0.358 | -0.206 | -0.13 |
| 0.980000000000002 | -0.357 | -0.205 | -0.13 |
| 0.982000000000002 | -0.356 | -0.205 | -0.13 |
| 0.984000000000003 | -0.355 | -0.204 | -0.13 |
| 0.986000000000003 | -0.354 | -0.204 | -0.129 |
| 0.988000000000003 | -0.353 | -0.204 | -0.129 |
| 0.990000000000002 | -0.352 | -0.203 | -0.129 |
| 0.992000000000002 | -0.351 | -0.203 | -0.129 |
| 0.994000000000003 | -0.35 | -0.202 | -0.129 |
| 0.996000000000003 | -0.349 | -0.202 | -0.128 |
| 0.998000000000003 | -0.348 | -0.202 | -0.128 |
| 1.000000000000002 | -0.347 | -0.201 | -0.128 |
| 1.002000000000002 | -0.346 | -0.201 | -0.128 |
| 1.004000000000002 | -0.345 | -0.2 | -0.128 |
| 1.006000000000002 | -0.344 | -0.2 | -0.127 |
| 1.008000000000002 | -0.343 | -0.2 | -0.127 |
| 1.010000000000002 | -0.342 | -0.199 | -0.127 |
| 1.012000000000002 | -0.341 | -0.199 | -0.127 |
| 1.014000000000002 | -0.34 | -0.198 | -0.127 |
| 1.016000000000002 | -0.339 | -0.198 | -0.126 |
| 1.018000000000002 | -0.338 | -0.198 | -0.126 |
| 1.020000000000002 | -0.337 | -0.197 | -0.126 |
| 1.022000000000002 | -0.336 | -0.197 | -0.126 |
| 1.024000000000002 | -0.335 | -0.196 | -0.126 |
| 1.026000000000002 | -0.334 | -0.196 | -0.125 |
| 1.028000000000002 | -0.333 | -0.196 | -0.125 |
| 1.030000000000002 | -0.332 | -0.195 | -0.125 |
| 1.032000000000002 | -0.331 | -0.195 | -0.125 |
| 1.034000000000002 | -0.33 | -0.195 | -0.125 |
| 1.036000000000002 | -0.329 | -0.194 | -0.124 |
| 1.038000000000002 | -0.328 | -0.194 | -0.124 |
| 1.040000000000002 | -0.327 | -0.193 | -0.124 |
| 1.042000000000002 | -0.326 | -0.193 | -0.124 |
| 1.044000000000002 | -0.326 | -0.193 | -0.124 |
| 1.046000000000002 | -0.325 | -0.192 | -0.123 |
| 1.048000000000002 | -0.324 | -0.192 | -0.123 |
| 1.050000000000002 | -0.323 | -0.192 | -0.123 |
| 1.052000000000002 | -0.322 | -0.191 | -0.123 |
| 1.054000000000002 | -0.321 | -0.191 | -0.123 |
| 1.056000000000002 | -0.32 | -0.19 | -0.123 |
| 1.058000000000002 | -0.319 | -0.19 | -0.122 |
| 1.060000000000002 | -0.318 | -0.19 | -0.122 |
| 1.062000000000002 | -0.317 | -0.189 | -0.122 |
| 1.064000000000002 | -0.317 | -0.189 | -0.122 |
| 1.066000000000002 | -0.316 | -0.189 | -0.122 |
| 1.068000000000002 | -0.315 | -0.188 | -0.121 |
| 1.070000000000002 | -0.314 | -0.188 | -0.121 |
| 1.072000000000002 | -0.313 | -0.187 | -0.121 |
| 1.074000000000003 | -0.312 | -0.187 | -0.121 |
| 1.076000000000003 | -0.311 | -0.187 | -0.121 |
| 1.078000000000003 | -0.31 | -0.186 | -0.12 |
| 1.080000000000002 | -0.31 | -0.186 | -0.12 |
| 1.082000000000002 | -0.309 | -0.186 | -0.12 |
| 1.084000000000003 | -0.308 | -0.185 | -0.12 |
| 1.086000000000003 | -0.307 | -0.185 | -0.12 |
| 1.088000000000003 | -0.306 | -0.185 | -0.12 |
| 1.090000000000002 | -0.305 | -0.184 | -0.119 |
| 1.092000000000002 | -0.305 | -0.184 | -0.119 |
| 1.094000000000003 | -0.304 | -0.184 | -0.119 |
| 1.096000000000003 | -0.303 | -0.183 | -0.119 |
| 1.098000000000003 | -0.302 | -0.183 | -0.119 |
| 1.100000000000003 | -0.301 | -0.182 | -0.118 |
| 1.102000000000003 | -0.3 | -0.182 | -0.118 |
| 1.104000000000003 | -0.3 | -0.182 | -0.118 |
| 1.106000000000003 | -0.299 | -0.181 | -0.118 |
| 1.108000000000003 | -0.298 | -0.181 | -0.118 |
| 1.110000000000003 | -0.297 | -0.181 | -0.118 |
| 1.112000000000003 | -0.296 | -0.18 | -0.117 |
| 1.114000000000003 | -0.296 | -0.18 | -0.117 |
| 1.116000000000003 | -0.295 | -0.18 | -0.117 |
| 1.118000000000003 | -0.294 | -0.179 | -0.117 |
| 1.120000000000003 | -0.293 | -0.179 | -0.117 |
| 1.122000000000003 | -0.292 | -0.179 | -0.117 |
| 1.124000000000003 | -0.292 | -0.178 | -0.116 |
| 1.126000000000003 | -0.291 | -0.178 | -0.116 |
| 1.128000000000003 | -0.29 | -0.178 | -0.116 |
| 1.130000000000003 | -0.289 | -0.177 | -0.116 |
| 1.132000000000003 | -0.288 | -0.177 | -0.116 |
| 1.134000000000003 | -0.288 | -0.177 | -0.116 |
| 1.136000000000003 | -0.287 | -0.176 | -0.115 |
| 1.138000000000003 | -0.286 | -0.176 | -0.115 |
| 1.140000000000003 | -0.285 | -0.176 | -0.115 |
| 1.142000000000003 | -0.285 | -0.175 | -0.115 |
| 1.144000000000003 | -0.284 | -0.175 | -0.115 |
| 1.146000000000003 | -0.283 | -0.175 | -0.114 |
| 1.148000000000003 | -0.282 | -0.174 | -0.114 |
| 1.150000000000003 | -0.282 | -0.174 | -0.114 |
| 1.152000000000003 | -0.281 | -0.174 | -0.114 |
| 1.154000000000003 | -0.28 | -0.173 | -0.114 |
| 1.156000000000003 | -0.279 | -0.173 | -0.114 |
| 1.158000000000003 | -0.279 | -0.173 | -0.113 |
| 1.160000000000003 | -0.278 | -0.172 | -0.113 |
| 1.162000000000003 | -0.277 | -0.172 | -0.113 |
| 1.164000000000003 | -0.276 | -0.172 | -0.113 |
| 1.166000000000003 | -0.276 | -0.171 | -0.113 |
| 1.168000000000003 | -0.275 | -0.171 | -0.113 |
| 1.170000000000003 | -0.274 | -0.171 | -0.112 |
| 1.172000000000003 | -0.273 | -0.171 | -0.112 |
| 1.174000000000003 | -0.273 | -0.17 | -0.112 |
| 1.176000000000003 | -0.272 | -0.17 | -0.112 |
| 1.178000000000003 | -0.271 | -0.17 | -0.112 |
| 1.180000000000003 | -0.271 | -0.169 | -0.112 |
| 1.182000000000003 | -0.27 | -0.169 | -0.112 |
| 1.184000000000003 | -0.269 | -0.169 | -0.111 |
| 1.186000000000003 | -0.269 | -0.168 | -0.111 |
| 1.188000000000003 | -0.268 | -0.168 | -0.111 |
| 1.190000000000003 | -0.267 | -0.168 | -0.111 |
| 1.192000000000003 | -0.266 | -0.167 | -0.111 |
| 1.194000000000003 | -0.266 | -0.167 | -0.111 |
| 1.196000000000003 | -0.265 | -0.167 | -0.11 |
| 1.198000000000003 | -0.264 | -0.166 | -0.11 |
| 1.200000000000003 | -0.264 | -0.166 | -0.11 |
| 1.202000000000003 | -0.263 | -0.166 | -0.11 |
| 1.204000000000003 | -0.262 | -0.166 | -0.11 |
| 1.206000000000003 | -0.262 | -0.165 | -0.11 |
| 1.208000000000003 | -0.261 | -0.165 | -0.109 |
| 1.210000000000003 | -0.26 | -0.165 | -0.109 |
| 1.212000000000003 | -0.26 | -0.164 | -0.109 |
| 1.214000000000003 | -0.259 | -0.164 | -0.109 |
| 1.216000000000003 | -0.258 | -0.164 | -0.109 |
| 1.218000000000003 | -0.258 | -0.163 | -0.109 |
| 1.220000000000003 | -0.257 | -0.163 | -0.108 |
| 1.222000000000003 | -0.256 | -0.163 | -0.108 |
| 1.224000000000003 | -0.256 | -0.163 | -0.108 |
| 1.226000000000003 | -0.255 | -0.162 | -0.108 |
| 1.228000000000003 | -0.254 | -0.162 | -0.108 |
| 1.230000000000003 | -0.254 | -0.162 | -0.108 |
| 1.232000000000003 | -0.253 | -0.161 | -0.108 |
| 1.234000000000003 | -0.252 | -0.161 | -0.107 |
| 1.236000000000003 | -0.252 | -0.161 | -0.107 |
| 1.238000000000003 | -0.251 | -0.16 | -0.107 |
| 1.240000000000003 | -0.25 | -0.16 | -0.107 |
| 1.242000000000003 | -0.25 | -0.16 | -0.107 |
| 1.244000000000003 | -0.249 | -0.16 | -0.107 |
| 1.246000000000003 | -0.249 | -0.159 | -0.106 |
| 1.248000000000003 | -0.248 | -0.159 | -0.106 |
| 1.250000000000003 | -0.247 | -0.159 | -0.106 |
| 1.252000000000003 | -0.247 | -0.158 | -0.106 |
| 1.254000000000003 | -0.246 | -0.158 | -0.106 |
| 1.256000000000003 | -0.245 | -0.158 | -0.106 |
| 1.258000000000003 | -0.245 | -0.158 | -0.106 |
| 1.260000000000003 | -0.244 | -0.157 | -0.105 |
| 1.262000000000003 | -0.244 | -0.157 | -0.105 |
| 1.264000000000003 | -0.243 | -0.157 | -0.105 |
| 1.266000000000003 | -0.242 | -0.156 | -0.105 |
| 1.268000000000003 | -0.242 | -0.156 | -0.105 |
| 1.270000000000003 | -0.241 | -0.156 | -0.105 |
| 1.272000000000003 | -0.241 | -0.156 | -0.105 |
| 1.274000000000003 | -0.24 | -0.155 | -0.104 |
| 1.276000000000003 | -0.239 | -0.155 | -0.104 |
| 1.278000000000003 | -0.239 | -0.155 | -0.104 |
| 1.280000000000003 | -0.238 | -0.154 | -0.104 |
| 1.282000000000003 | -0.238 | -0.154 | -0.104 |
| 1.284000000000003 | -0.237 | -0.154 | -0.104 |
| 1.286000000000003 | -0.236 | -0.154 | -0.103 |
| 1.288000000000003 | -0.236 | -0.153 | -0.103 |
| 1.290000000000003 | -0.235 | -0.153 | -0.103 |
| 1.292000000000003 | -0.235 | -0.153 | -0.103 |
| 1.294000000000003 | -0.234 | -0.153 | -0.103 |
| 1.296000000000003 | -0.234 | -0.152 | -0.103 |
| 1.298000000000003 | -0.233 | -0.152 | -0.103 |
| 1.300000000000003 | -0.232 | -0.152 | -0.102 |
| 1.302000000000003 | -0.232 | -0.151 | -0.102 |
| 1.304000000000003 | -0.231 | -0.151 | -0.102 |
| 1.306000000000003 | -0.231 | -0.151 | -0.102 |
| 1.308000000000003 | -0.23 | -0.151 | -0.102 |
| 1.310000000000003 | -0.23 | -0.15 | -0.102 |
| 1.312000000000003 | -0.229 | -0.15 | -0.102 |
| 1.314000000000003 | -0.228 | -0.15 | -0.101 |
| 1.316000000000003 | -0.228 | -0.15 | -0.101 |
| 1.318000000000003 | -0.227 | -0.149 | -0.101 |
| 1.320000000000003 | -0.227 | -0.149 | -0.101 |
| 1.322000000000003 | -0.226 | -0.149 | -0.101 |
| 1.324000000000003 | -0.226 | -0.149 | -0.101 |
| 1.326000000000003 | -0.225 | -0.148 | -0.101 |
| 1.328000000000003 | -0.225 | -0.148 | -0.1 |
| 1.330000000000003 | -0.224 | -0.148 | -0.1 |
| 1.332000000000003 | -0.224 | -0.148 | -0.1 |
| 1.334000000000003 | -0.223 | -0.147 | -0.1 |
| 1.336000000000003 | -0.222 | -0.147 | -0.1 |
| 1.338000000000003 | -0.222 | -0.147 | -0.1 |
| 1.340000000000003 | -0.221 | -0.146 | -0.1 |
| 1.342000000000003 | -0.221 | -0.146 | -0.1 |
| 1.344000000000003 | -0.22 | -0.146 | -0.099 |
| 1.346000000000003 | -0.22 | -0.146 | -0.099 |
| 1.348000000000003 | -0.219 | -0.145 | -0.099 |
| 1.350000000000003 | -0.219 | -0.145 | -0.099 |
| 1.352000000000003 | -0.218 | -0.145 | -0.099 |
| 1.354000000000003 | -0.218 | -0.145 | -0.099 |
| 1.356000000000003 | -0.217 | -0.144 | -0.099 |
| 1.358000000000003 | -0.217 | -0.144 | -0.098 |
| 1.360000000000003 | -0.216 | -0.144 | -0.098 |
| 1.362000000000003 | -0.216 | -0.144 | -0.098 |
| 1.364000000000003 | -0.215 | -0.143 | -0.098 |
| 1.366000000000003 | -0.215 | -0.143 | -0.098 |
| 1.368000000000003 | -0.214 | -0.143 | -0.098 |
| 1.370000000000003 | -0.214 | -0.143 | -0.098 |
| 1.372000000000003 | -0.213 | -0.142 | -0.097 |
| 1.374000000000003 | -0.213 | -0.142 | -0.097 |
| 1.376000000000003 | -0.212 | -0.142 | -0.097 |
| 1.378000000000003 | -0.212 | -0.142 | -0.097 |
| 1.380000000000003 | -0.211 | -0.141 | -0.097 |
| 1.382000000000003 | -0.211 | -0.141 | -0.097 |
| 1.384000000000003 | -0.21 | -0.141 | -0.097 |
| 1.386000000000003 | -0.21 | -0.141 | -0.097 |
| 1.388000000000003 | -0.209 | -0.14 | -0.096 |
| 1.390000000000003 | -0.209 | -0.14 | -0.096 |
| 1.392000000000003 | -0.208 | -0.14 | -0.096 |
| 1.394000000000003 | -0.208 | -0.14 | -0.096 |
| 1.396000000000003 | -0.207 | -0.139 | -0.096 |
| 1.398000000000003 | -0.207 | -0.139 | -0.096 |
| 1.400000000000003 | -0.206 | -0.139 | -0.096 |
| 1.402000000000003 | -0.206 | -0.139 | -0.095 |
| 1.404000000000003 | -0.205 | -0.139 | -0.095 |
| 1.406000000000003 | -0.205 | -0.138 | -0.095 |
| 1.408000000000003 | -0.204 | -0.138 | -0.095 |
| 1.410000000000003 | -0.204 | -0.138 | -0.095 |
| 1.412000000000003 | -0.203 | -0.138 | -0.095 |
| 1.414000000000003 | -0.203 | -0.137 | -0.095 |
| 1.416000000000003 | -0.202 | -0.137 | -0.095 |
| 1.418000000000003 | -0.202 | -0.137 | -0.094 |
| 1.420000000000003 | -0.201 | -0.137 | -0.094 |
| 1.422000000000003 | -0.201 | -0.136 | -0.094 |
| 1.424000000000003 | -0.2 | -0.136 | -0.094 |
| 1.426000000000003 | -0.2 | -0.136 | -0.094 |
| 1.428000000000003 | -0.2 | -0.136 | -0.094 |
| 1.430000000000003 | -0.199 | -0.135 | -0.094 |
| 1.432000000000003 | -0.199 | -0.135 | -0.094 |
| 1.434000000000003 | -0.198 | -0.135 | -0.093 |
| 1.436000000000003 | -0.198 | -0.135 | -0.093 |
| 1.438000000000003 | -0.197 | -0.135 | -0.093 |
| 1.440000000000003 | -0.197 | -0.134 | -0.093 |
| 1.442000000000003 | -0.196 | -0.134 | -0.093 |
| 1.444000000000003 | -0.196 | -0.134 | -0.093 |
| 1.446000000000003 | -0.195 | -0.134 | -0.093 |
| 1.448000000000003 | -0.195 | -0.133 | -0.093 |
| 1.450000000000003 | -0.195 | -0.133 | -0.092 |
| 1.452000000000003 | -0.194 | -0.133 | -0.092 |
| 1.454000000000003 | -0.194 | -0.133 | -0.092 |
| 1.456000000000003 | -0.193 | -0.133 | -0.092 |
| 1.458000000000003 | -0.193 | -0.132 | -0.092 |
| 1.460000000000003 | -0.192 | -0.132 | -0.092 |
| 1.462000000000003 | -0.192 | -0.132 | -0.092 |
| 1.464000000000003 | -0.191 | -0.132 | -0.092 |
| 1.466000000000003 | -0.191 | -0.131 | -0.091 |
| 1.468000000000003 | -0.191 | -0.131 | -0.091 |
| 1.470000000000003 | -0.19 | -0.131 | -0.091 |
| 1.472000000000003 | -0.19 | -0.131 | -0.091 |
| 1.474000000000003 | -0.189 | -0.131 | -0.091 |
| 1.476000000000003 | -0.189 | -0.13 | -0.091 |
| 1.478000000000003 | -0.188 | -0.13 | -0.091 |
| 1.480000000000003 | -0.188 | -0.13 | -0.091 |
| 1.482000000000003 | -0.188 | -0.13 | -0.09 |
| 1.484000000000003 | -0.187 | -0.129 | -0.09 |
| 1.486000000000003 | -0.187 | -0.129 | -0.09 |
| 1.488000000000003 | -0.186 | -0.129 | -0.09 |
| 1.490000000000003 | -0.186 | -0.129 | -0.09 |
| 1.492000000000003 | -0.186 | -0.129 | -0.09 |
| 1.494000000000003 | -0.185 | -0.128 | -0.09 |
| 1.496000000000003 | -0.185 | -0.128 | -0.09 |
| 1.498000000000003 | -0.184 | -0.128 | -0.09 |
| 1.500000000000003 | -0.184 | -0.128 | -0.089 |
| 1.502000000000003 | -0.183 | -0.127 | -0.089 |
| 1.504000000000003 | -0.183 | -0.127 | -0.089 |
| 1.506000000000003 | -0.183 | -0.127 | -0.089 |
| 1.508000000000003 | -0.182 | -0.127 | -0.089 |
| 1.510000000000003 | -0.182 | -0.127 | -0.089 |
| 1.512000000000003 | -0.181 | -0.126 | -0.089 |
| 1.514000000000003 | -0.181 | -0.126 | -0.089 |
| 1.516000000000003 | -0.181 | -0.126 | -0.088 |
| 1.518000000000003 | -0.18 | -0.126 | -0.088 |
| 1.520000000000003 | -0.18 | -0.126 | -0.088 |
| 1.522000000000003 | -0.179 | -0.125 | -0.088 |
| 1.524000000000003 | -0.179 | -0.125 | -0.088 |
| 1.526000000000003 | -0.179 | -0.125 | -0.088 |
| 1.528000000000003 | -0.178 | -0.125 | -0.088 |
| 1.530000000000003 | -0.178 | -0.125 | -0.088 |
| 1.532000000000003 | -0.177 | -0.124 | -0.088 |
| 1.534000000000003 | -0.177 | -0.124 | -0.087 |
| 1.536000000000003 | -0.177 | -0.124 | -0.087 |
| 1.538000000000003 | -0.176 | -0.124 | -0.087 |
| 1.540000000000003 | -0.176 | -0.124 | -0.087 |
| 1.542000000000003 | -0.176 | -0.123 | -0.087 |
| 1.544000000000003 | -0.175 | -0.123 | -0.087 |
| 1.546000000000003 | -0.175 | -0.123 | -0.087 |
| 1.548000000000003 | -0.174 | -0.123 | -0.087 |
| 1.550000000000003 | -0.174 | -0.123 | -0.087 |
| 1.552000000000003 | -0.174 | -0.122 | -0.086 |
| 1.554000000000003 | -0.173 | -0.122 | -0.086 |
| 1.556000000000003 | -0.173 | -0.122 | -0.086 |
| 1.558000000000003 | -0.172 | -0.122 | -0.086 |
| 1.560000000000003 | -0.172 | -0.122 | -0.086 |
| 1.562000000000003 | -0.172 | -0.121 | -0.086 |
| 1.564000000000003 | -0.171 | -0.121 | -0.086 |
| 1.566000000000003 | -0.171 | -0.121 | -0.086 |
| 1.568000000000003 | -0.171 | -0.121 | -0.086 |
| 1.570000000000003 | -0.17 | -0.121 | -0.085 |
| 1.572000000000003 | -0.17 | -0.12 | -0.085 |
| 1.574000000000003 | -0.17 | -0.12 | -0.085 |
| 1.576000000000003 | -0.169 | -0.12 | -0.085 |
| 1.578000000000003 | -0.169 | -0.12 | -0.085 |
| 1.580000000000003 | -0.168 | -0.12 | -0.085 |
| 1.582000000000003 | -0.168 | -0.119 | -0.085 |
| 1.584000000000003 | -0.168 | -0.119 | -0.085 |
| 1.586000000000003 | -0.167 | -0.119 | -0.085 |
| 1.588000000000003 | -0.167 | -0.119 | -0.084 |
| 1.590000000000003 | -0.167 | -0.119 | -0.084 |
| 1.592000000000003 | -0.166 | -0.118 | -0.084 |
| 1.594000000000003 | -0.166 | -0.118 | -0.084 |
| 1.596000000000003 | -0.166 | -0.118 | -0.084 |
| 1.598000000000003 | -0.165 | -0.118 | -0.084 |
| 1.600000000000003 | -0.165 | -0.118 | -0.084 |
| 1.602000000000003 | -0.165 | -0.117 | -0.084 |
| 1.604000000000003 | -0.164 | -0.117 | -0.084 |
| 1.606000000000003 | -0.164 | -0.117 | -0.083 |
| 1.608000000000003 | -0.163 | -0.117 | -0.083 |
| 1.610000000000003 | -0.163 | -0.117 | -0.083 |
| 1.612000000000003 | -0.163 | -0.116 | -0.083 |
| 1.614000000000003 | -0.162 | -0.116 | -0.083 |
| 1.616000000000003 | -0.162 | -0.116 | -0.083 |
| 1.618000000000003 | -0.162 | -0.116 | -0.083 |
| 1.620000000000003 | -0.161 | -0.116 | -0.083 |
| 1.622000000000003 | -0.161 | -0.116 | -0.083 |
| 1.624000000000003 | -0.161 | -0.115 | -0.082 |
| 1.626000000000003 | -0.16 | -0.115 | -0.082 |
| 1.628000000000003 | -0.16 | -0.115 | -0.082 |
| 1.630000000000003 | -0.16 | -0.115 | -0.082 |
| 1.632000000000003 | -0.159 | -0.115 | -0.082 |
| 1.634000000000003 | -0.159 | -0.114 | -0.082 |
| 1.636000000000003 | -0.159 | -0.114 | -0.082 |
| 1.638000000000003 | -0.158 | -0.114 | -0.082 |
| 1.640000000000003 | -0.158 | -0.114 | -0.082 |
| 1.642000000000003 | -0.158 | -0.114 | -0.082 |
| 1.644000000000003 | -0.157 | -0.114 | -0.081 |
| 1.646000000000003 | -0.157 | -0.113 | -0.081 |
| 1.648000000000003 | -0.157 | -0.113 | -0.081 |
| 1.650000000000003 | -0.156 | -0.113 | -0.081 |
| 1.652000000000003 | -0.156 | -0.113 | -0.081 |
| 1.654000000000003 | -0.156 | -0.113 | -0.081 |
| 1.656000000000003 | -0.155 | -0.112 | -0.081 |
| 1.658000000000003 | -0.155 | -0.112 | -0.081 |
| 1.660000000000003 | -0.155 | -0.112 | -0.081 |
| 1.662000000000003 | -0.154 | -0.112 | -0.08 |
| 1.664000000000003 | -0.154 | -0.112 | -0.08 |
| 1.666000000000003 | -0.154 | -0.112 | -0.08 |
| 1.668000000000003 | -0.154 | -0.111 | -0.08 |
| 1.670000000000003 | -0.153 | -0.111 | -0.08 |
| 1.672000000000003 | -0.153 | -0.111 | -0.08 |
| 1.674000000000003 | -0.153 | -0.111 | -0.08 |
| 1.676000000000003 | -0.152 | -0.111 | -0.08 |
| 1.678000000000003 | -0.152 | -0.111 | -0.08 |
| 1.680000000000003 | -0.152 | -0.11 | -0.08 |
| 1.682000000000003 | -0.151 | -0.11 | -0.079 |
| 1.684000000000003 | -0.151 | -0.11 | -0.079 |
| 1.686000000000003 | -0.151 | -0.11 | -0.079 |
| 1.688000000000003 | -0.15 | -0.11 | -0.079 |
| 1.690000000000003 | -0.15 | -0.109 | -0.079 |
| 1.692000000000003 | -0.15 | -0.109 | -0.079 |
| 1.694000000000003 | -0.149 | -0.109 | -0.079 |
| 1.696000000000003 | -0.149 | -0.109 | -0.079 |
| 1.698000000000003 | -0.149 | -0.109 | -0.079 |
| 1.700000000000003 | -0.149 | -0.109 | -0.079 |
| 1.702000000000003 | -0.148 | -0.108 | -0.078 |
| 1.704000000000003 | -0.148 | -0.108 | -0.078 |
| 1.706000000000003 | -0.148 | -0.108 | -0.078 |
| 1.708000000000003 | -0.147 | -0.108 | -0.078 |
| 1.710000000000003 | -0.147 | -0.108 | -0.078 |
| 1.712000000000003 | -0.147 | -0.108 | -0.078 |
| 1.714000000000003 | -0.146 | -0.107 | -0.078 |
| 1.716000000000003 | -0.146 | -0.107 | -0.078 |
| 1.718000000000003 | -0.146 | -0.107 | -0.078 |
| 1.720000000000003 | -0.146 | -0.107 | -0.078 |
| 1.722000000000003 | -0.145 | -0.107 | -0.078 |
| 1.724000000000003 | -0.145 | -0.107 | -0.077 |
| 1.726000000000003 | -0.145 | -0.106 | -0.077 |
| 1.728000000000003 | -0.144 | -0.106 | -0.077 |
| 1.730000000000003 | -0.144 | -0.106 | -0.077 |
| 1.732000000000003 | -0.144 | -0.106 | -0.077 |
| 1.734000000000003 | -0.144 | -0.106 | -0.077 |
| 1.736000000000003 | -0.143 | -0.106 | -0.077 |
| 1.738000000000003 | -0.143 | -0.105 | -0.077 |
| 1.740000000000003 | -0.143 | -0.105 | -0.077 |
| 1.742000000000003 | -0.142 | -0.105 | -0.077 |
| 1.744000000000003 | -0.142 | -0.105 | -0.076 |
| 1.746000000000003 | -0.142 | -0.105 | -0.076 |
| 1.748000000000003 | -0.142 | -0.105 | -0.076 |
| 1.750000000000003 | -0.141 | -0.104 | -0.076 |
| 1.752000000000003 | -0.141 | -0.104 | -0.076 |
| 1.754000000000003 | -0.141 | -0.104 | -0.076 |
| 1.756000000000003 | -0.14 | -0.104 | -0.076 |
| 1.758000000000003 | -0.14 | -0.104 | -0.076 |
| 1.760000000000003 | -0.14 | -0.104 | -0.076 |
| 1.762000000000003 | -0.14 | -0.103 | -0.076 |
| 1.764000000000003 | -0.139 | -0.103 | -0.076 |
| 1.766000000000003 | -0.139 | -0.103 | -0.075 |
| 1.768000000000003 | -0.139 | -0.103 | -0.075 |
| 1.770000000000003 | -0.139 | -0.103 | -0.075 |
| 1.772000000000003 | -0.138 | -0.103 | -0.075 |
| 1.774000000000003 | -0.138 | -0.103 | -0.075 |
| 1.776000000000003 | -0.138 | -0.102 | -0.075 |
| 1.778000000000003 | -0.137 | -0.102 | -0.075 |
| 1.780000000000003 | -0.137 | -0.102 | -0.075 |
| 1.782000000000003 | -0.137 | -0.102 | -0.075 |
| 1.784000000000003 | -0.137 | -0.102 | -0.075 |
| 1.786000000000003 | -0.136 | -0.102 | -0.074 |
| 1.788000000000003 | -0.136 | -0.101 | -0.074 |
| 1.790000000000003 | -0.136 | -0.101 | -0.074 |
| 1.792000000000003 | -0.136 | -0.101 | -0.074 |
| 1.794000000000003 | -0.135 | -0.101 | -0.074 |
| 1.796000000000003 | -0.135 | -0.101 | -0.074 |
| 1.798000000000003 | -0.135 | -0.101 | -0.074 |
| 1.800000000000003 | -0.134 | -0.101 | -0.074 |
| 1.802000000000003 | -0.134 | -0.1 | -0.074 |
| 1.804000000000003 | -0.134 | -0.1 | -0.074 |
| 1.806000000000003 | -0.134 | -0.1 | -0.074 |
| 1.808000000000003 | -0.133 | -0.1 | -0.073 |
| 1.810000000000003 | -0.133 | -0.1 | -0.073 |
| 1.812000000000003 | -0.133 | -0.1 | -0.073 |
| 1.814000000000003 | -0.133 | -0.099 | -0.073 |
| 1.816000000000003 | -0.132 | -0.099 | -0.073 |
| 1.818000000000003 | -0.132 | -0.099 | -0.073 |
| 1.820000000000003 | -0.132 | -0.099 | -0.073 |
| 1.822000000000003 | -0.132 | -0.099 | -0.073 |
| 1.824000000000003 | -0.131 | -0.099 | -0.073 |
| 1.826000000000003 | -0.131 | -0.099 | -0.073 |
| 1.828000000000003 | -0.131 | -0.098 | -0.073 |
| 1.830000000000003 | -0.131 | -0.098 | -0.072 |
| 1.832000000000003 | -0.13 | -0.098 | -0.072 |
| 1.834000000000003 | -0.13 | -0.098 | -0.072 |
| 1.836000000000003 | -0.13 | -0.098 | -0.072 |
| 1.838000000000003 | -0.13 | -0.098 | -0.072 |
| 1.840000000000003 | -0.129 | -0.098 | -0.072 |
| 1.842000000000003 | -0.129 | -0.097 | -0.072 |
| 1.844000000000003 | -0.129 | -0.097 | -0.072 |
| 1.846000000000003 | -0.129 | -0.097 | -0.072 |
| 1.848000000000003 | -0.128 | -0.097 | -0.072 |
| 1.850000000000003 | -0.128 | -0.097 | -0.072 |
| 1.852000000000003 | -0.128 | -0.097 | -0.072 |
| 1.854000000000003 | -0.128 | -0.096 | -0.071 |
| 1.856000000000003 | -0.127 | -0.096 | -0.071 |
| 1.858000000000003 | -0.127 | -0.096 | -0.071 |
| 1.860000000000003 | -0.127 | -0.096 | -0.071 |
| 1.862000000000003 | -0.127 | -0.096 | -0.071 |
| 1.864000000000003 | -0.126 | -0.096 | -0.071 |
| 1.866000000000003 | -0.126 | -0.096 | -0.071 |
| 1.868000000000003 | -0.126 | -0.095 | -0.071 |
| 1.870000000000003 | -0.126 | -0.095 | -0.071 |
| 1.872000000000003 | -0.126 | -0.095 | -0.071 |
| 1.874000000000003 | -0.125 | -0.095 | -0.071 |
| 1.876000000000003 | -0.125 | -0.095 | -0.07 |
| 1.878000000000003 | -0.125 | -0.095 | -0.07 |
| 1.880000000000003 | -0.125 | -0.095 | -0.07 |
| 1.882000000000003 | -0.124 | -0.094 | -0.07 |
| 1.884000000000003 | -0.124 | -0.094 | -0.07 |
| 1.886000000000003 | -0.124 | -0.094 | -0.07 |
| 1.888000000000003 | -0.124 | -0.094 | -0.07 |
| 1.890000000000003 | -0.123 | -0.094 | -0.07 |
| 1.892000000000003 | -0.123 | -0.094 | -0.07 |
| 1.894000000000003 | -0.123 | -0.094 | -0.07 |
| 1.896000000000003 | -0.123 | -0.093 | -0.07 |
| 1.898000000000003 | -0.122 | -0.093 | -0.07 |
| 1.900000000000003 | -0.122 | -0.093 | -0.069 |
| 1.902000000000003 | -0.122 | -0.093 | -0.069 |
| 1.904000000000003 | -0.122 | -0.093 | -0.069 |
| 1.906000000000003 | -0.122 | -0.093 | -0.069 |
| 1.908000000000003 | -0.121 | -0.093 | -0.069 |
| 1.910000000000003 | -0.121 | -0.093 | -0.069 |
| 1.912000000000003 | -0.121 | -0.092 | -0.069 |
| 1.914000000000003 | -0.121 | -0.092 | -0.069 |
| 1.916000000000003 | -0.12 | -0.092 | -0.069 |
| 1.918000000000003 | -0.12 | -0.092 | -0.069 |
| 1.920000000000003 | -0.12 | -0.092 | -0.069 |
| 1.922000000000003 | -0.12 | -0.092 | -0.069 |
| 1.924000000000003 | -0.12 | -0.092 | -0.068 |
| 1.926000000000003 | -0.119 | -0.091 | -0.068 |
| 1.928000000000003 | -0.119 | -0.091 | -0.068 |
| 1.930000000000003 | -0.119 | -0.091 | -0.068 |
| 1.932000000000003 | -0.119 | -0.091 | -0.068 |
| 1.934000000000003 | -0.118 | -0.091 | -0.068 |
| 1.936000000000003 | -0.118 | -0.091 | -0.068 |
| 1.938000000000003 | -0.118 | -0.091 | -0.068 |
| 1.940000000000003 | -0.118 | -0.091 | -0.068 |
| 1.942000000000003 | -0.118 | -0.09 | -0.068 |
| 1.944000000000003 | -0.117 | -0.09 | -0.068 |
| 1.946000000000003 | -0.117 | -0.09 | -0.068 |
| 1.948000000000003 | -0.117 | -0.09 | -0.068 |
| 1.950000000000003 | -0.117 | -0.09 | -0.067 |
| 1.952000000000003 | -0.117 | -0.09 | -0.067 |
| 1.954000000000003 | -0.116 | -0.09 | -0.067 |
| 1.956000000000003 | -0.116 | -0.089 | -0.067 |
| 1.958000000000003 | -0.116 | -0.089 | -0.067 |
| 1.960000000000003 | -0.116 | -0.089 | -0.067 |
| 1.962000000000003 | -0.115 | -0.089 | -0.067 |
| 1.964000000000003 | -0.115 | -0.089 | -0.067 |
| 1.966000000000003 | -0.115 | -0.089 | -0.067 |
| 1.968000000000003 | -0.115 | -0.089 | -0.067 |
| 1.970000000000003 | -0.115 | -0.089 | -0.067 |
| 1.972000000000003 | -0.114 | -0.088 | -0.067 |
| 1.974000000000003 | -0.114 | -0.088 | -0.066 |
| 1.976000000000003 | -0.114 | -0.088 | -0.066 |
| 1.978000000000003 | -0.114 | -0.088 | -0.066 |
| 1.980000000000003 | -0.114 | -0.088 | -0.066 |
| 1.982000000000003 | -0.113 | -0.088 | -0.066 |
| 1.984000000000003 | -0.113 | -0.088 | -0.066 |
| 1.986000000000003 | -0.113 | -0.088 | -0.066 |
| 1.988000000000003 | -0.113 | -0.087 | -0.066 |
| 1.990000000000003 | -0.113 | -0.087 | -0.066 |
| 1.992000000000003 | -0.112 | -0.087 | -0.066 |
| 1.994000000000003 | -0.112 | -0.087 | -0.066 |
| 1.996000000000003 | -0.112 | -0.087 | -0.066 |
| 1.998000000000003 | -0.112 | -0.087 | -0.066 |
| 2.000000000000003 | -0.112 | -0.087 | -0.065 |